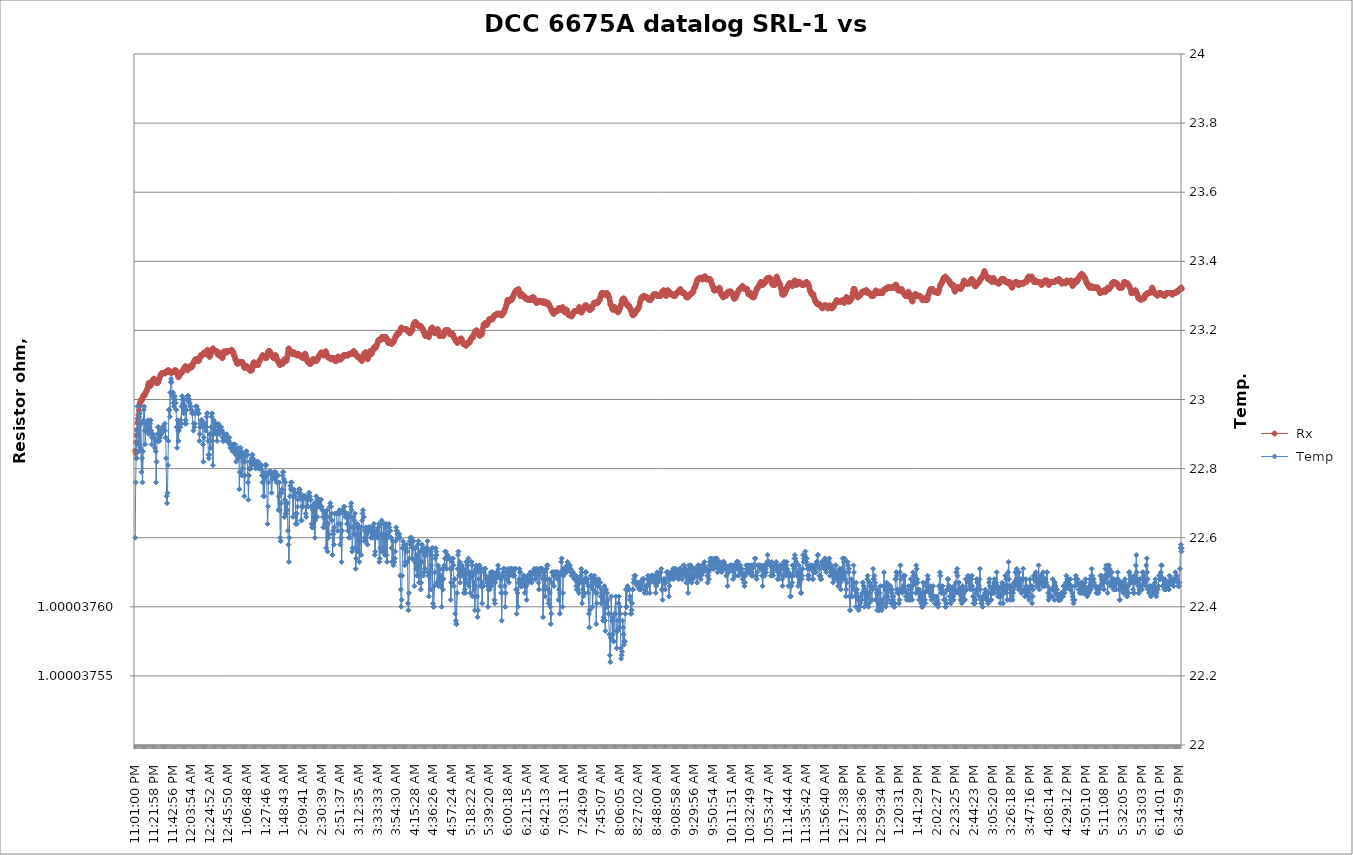
| Category |  Rx |
|---|---|
| 2021-03-23 23:01:00 | 1 |
| 2021-03-23 23:01:31 | 1 |
| 2021-03-23 23:02:02 | 1 |
| 2021-03-23 23:02:32 | 1 |
| 2021-03-23 23:03:03 | 1 |
| 2021-03-23 23:03:34 | 1 |
| 2021-03-23 23:04:04 | 1 |
| 2021-03-23 23:04:35 | 1 |
| 2021-03-23 23:05:06 | 1 |
| 2021-03-23 23:05:36 | 1 |
| 2021-03-23 23:06:07 | 1 |
| 2021-03-23 23:06:38 | 1 |
| 2021-03-23 23:07:08 | 1 |
| 2021-03-23 23:07:39 | 1 |
| 2021-03-23 23:08:10 | 1 |
| 2021-03-23 23:08:41 | 1 |
| 2021-03-23 23:09:11 | 1 |
| 2021-03-23 23:09:42 | 1 |
| 2021-03-23 23:10:13 | 1 |
| 2021-03-23 23:10:43 | 1 |
| 2021-03-23 23:11:14 | 1 |
| 2021-03-23 23:11:45 | 1 |
| 2021-03-23 23:12:15 | 1 |
| 2021-03-23 23:12:46 | 1 |
| 2021-03-23 23:13:17 | 1 |
| 2021-03-23 23:13:47 | 1 |
| 2021-03-23 23:14:18 | 1 |
| 2021-03-23 23:14:49 | 1 |
| 2021-03-23 23:15:19 | 1 |
| 2021-03-23 23:15:50 | 1 |
| 2021-03-23 23:16:21 | 1 |
| 2021-03-23 23:16:51 | 1 |
| 2021-03-23 23:17:22 | 1 |
| 2021-03-23 23:17:53 | 1 |
| 2021-03-23 23:18:23 | 1 |
| 2021-03-23 23:18:54 | 1 |
| 2021-03-23 23:19:25 | 1 |
| 2021-03-23 23:19:55 | 1 |
| 2021-03-23 23:20:26 | 1 |
| 2021-03-23 23:20:57 | 1 |
| 2021-03-23 23:21:28 | 1 |
| 2021-03-23 23:21:58 | 1 |
| 2021-03-23 23:22:29 | 1 |
| 2021-03-23 23:23:00 | 1 |
| 2021-03-23 23:23:30 | 1 |
| 2021-03-23 23:24:01 | 1 |
| 2021-03-23 23:24:32 | 1 |
| 2021-03-23 23:25:02 | 1 |
| 2021-03-23 23:25:33 | 1 |
| 2021-03-23 23:26:04 | 1 |
| 2021-03-23 23:26:34 | 1 |
| 2021-03-23 23:27:05 | 1 |
| 2021-03-23 23:27:36 | 1 |
| 2021-03-23 23:28:06 | 1 |
| 2021-03-23 23:28:37 | 1 |
| 2021-03-23 23:29:08 | 1 |
| 2021-03-23 23:29:38 | 1 |
| 2021-03-23 23:30:09 | 1 |
| 2021-03-23 23:30:40 | 1 |
| 2021-03-23 23:31:10 | 1 |
| 2021-03-23 23:31:41 | 1 |
| 2021-03-23 23:32:12 | 1 |
| 2021-03-23 23:32:42 | 1 |
| 2021-03-23 23:33:13 | 1 |
| 2021-03-23 23:33:44 | 1 |
| 2021-03-23 23:34:15 | 1 |
| 2021-03-23 23:34:45 | 1 |
| 2021-03-23 23:35:16 | 1 |
| 2021-03-23 23:35:47 | 1 |
| 2021-03-23 23:36:17 | 1 |
| 2021-03-23 23:36:48 | 1 |
| 2021-03-23 23:37:19 | 1 |
| 2021-03-23 23:37:49 | 1 |
| 2021-03-23 23:38:20 | 1 |
| 2021-03-23 23:38:51 | 1 |
| 2021-03-23 23:39:21 | 1 |
| 2021-03-23 23:39:52 | 1 |
| 2021-03-23 23:40:23 | 1 |
| 2021-03-23 23:40:53 | 1 |
| 2021-03-23 23:41:24 | 1 |
| 2021-03-23 23:41:55 | 1 |
| 2021-03-23 23:42:25 | 1 |
| 2021-03-23 23:42:56 | 1 |
| 2021-03-23 23:43:27 | 1 |
| 2021-03-23 23:43:57 | 1 |
| 2021-03-23 23:44:28 | 1 |
| 2021-03-23 23:44:59 | 1 |
| 2021-03-23 23:45:30 | 1 |
| 2021-03-23 23:46:00 | 1 |
| 2021-03-23 23:46:31 | 1 |
| 2021-03-23 23:47:02 | 1 |
| 2021-03-23 23:47:32 | 1 |
| 2021-03-23 23:48:03 | 1 |
| 2021-03-23 23:48:34 | 1 |
| 2021-03-23 23:49:04 | 1 |
| 2021-03-23 23:49:35 | 1 |
| 2021-03-23 23:50:06 | 1 |
| 2021-03-23 23:50:36 | 1 |
| 2021-03-23 23:51:07 | 1 |
| 2021-03-23 23:51:38 | 1 |
| 2021-03-23 23:52:08 | 1 |
| 2021-03-23 23:52:39 | 1 |
| 2021-03-23 23:53:10 | 1 |
| 2021-03-23 23:53:40 | 1 |
| 2021-03-23 23:54:11 | 1 |
| 2021-03-23 23:54:42 | 1 |
| 2021-03-23 23:55:12 | 1 |
| 2021-03-23 23:55:43 | 1 |
| 2021-03-23 23:56:14 | 1 |
| 2021-03-23 23:56:45 | 1 |
| 2021-03-23 23:57:15 | 1 |
| 2021-03-23 23:57:46 | 1 |
| 2021-03-23 23:58:17 | 1 |
| 2021-03-23 23:58:47 | 1 |
| 2021-03-23 23:59:18 | 1 |
| 2021-03-23 23:59:49 | 1 |
| 2021-03-24 00:00:19 | 1 |
| 2021-03-24 00:00:50 | 1 |
| 2021-03-24 00:01:21 | 1 |
| 2021-03-24 00:01:51 | 1 |
| 2021-03-24 00:02:22 | 1 |
| 2021-03-24 00:02:53 | 1 |
| 2021-03-24 00:03:23 | 1 |
| 2021-03-24 00:03:54 | 1 |
| 2021-03-24 00:04:25 | 1 |
| 2021-03-24 00:04:55 | 1 |
| 2021-03-24 00:05:26 | 1 |
| 2021-03-24 00:05:57 | 1 |
| 2021-03-24 00:06:28 | 1 |
| 2021-03-24 00:06:58 | 1 |
| 2021-03-24 00:07:29 | 1 |
| 2021-03-24 00:08:00 | 1 |
| 2021-03-24 00:08:30 | 1 |
| 2021-03-24 00:09:01 | 1 |
| 2021-03-24 00:09:32 | 1 |
| 2021-03-24 00:10:02 | 1 |
| 2021-03-24 00:10:33 | 1 |
| 2021-03-24 00:11:04 | 1 |
| 2021-03-24 00:11:34 | 1 |
| 2021-03-24 00:12:05 | 1 |
| 2021-03-24 00:12:36 | 1 |
| 2021-03-24 00:13:06 | 1 |
| 2021-03-24 00:13:37 | 1 |
| 2021-03-24 00:14:08 | 1 |
| 2021-03-24 00:14:38 | 1 |
| 2021-03-24 00:15:09 | 1 |
| 2021-03-24 00:15:40 | 1 |
| 2021-03-24 00:16:10 | 1 |
| 2021-03-24 00:16:41 | 1 |
| 2021-03-24 00:17:12 | 1 |
| 2021-03-24 00:17:42 | 1 |
| 2021-03-24 00:18:13 | 1 |
| 2021-03-24 00:18:44 | 1 |
| 2021-03-24 00:19:14 | 1 |
| 2021-03-24 00:19:45 | 1 |
| 2021-03-24 00:20:16 | 1 |
| 2021-03-24 00:20:47 | 1 |
| 2021-03-24 00:21:17 | 1 |
| 2021-03-24 00:21:48 | 1 |
| 2021-03-24 00:22:19 | 1 |
| 2021-03-24 00:22:49 | 1 |
| 2021-03-24 00:23:20 | 1 |
| 2021-03-24 00:23:51 | 1 |
| 2021-03-24 00:24:21 | 1 |
| 2021-03-24 00:24:52 | 1 |
| 2021-03-24 00:25:23 | 1 |
| 2021-03-24 00:25:53 | 1 |
| 2021-03-24 00:26:24 | 1 |
| 2021-03-24 00:26:55 | 1 |
| 2021-03-24 00:27:25 | 1 |
| 2021-03-24 00:27:56 | 1 |
| 2021-03-24 00:28:27 | 1 |
| 2021-03-24 00:28:57 | 1 |
| 2021-03-24 00:29:28 | 1 |
| 2021-03-24 00:29:59 | 1 |
| 2021-03-24 00:30:29 | 1 |
| 2021-03-24 00:31:00 | 1 |
| 2021-03-24 00:31:31 | 1 |
| 2021-03-24 00:32:02 | 1 |
| 2021-03-24 00:32:32 | 1 |
| 2021-03-24 00:33:03 | 1 |
| 2021-03-24 00:33:34 | 1 |
| 2021-03-24 00:34:04 | 1 |
| 2021-03-24 00:34:35 | 1 |
| 2021-03-24 00:35:06 | 1 |
| 2021-03-24 00:35:36 | 1 |
| 2021-03-24 00:36:07 | 1 |
| 2021-03-24 00:36:38 | 1 |
| 2021-03-24 00:37:08 | 1 |
| 2021-03-24 00:37:39 | 1 |
| 2021-03-24 00:38:10 | 1 |
| 2021-03-24 00:38:40 | 1 |
| 2021-03-24 00:39:11 | 1 |
| 2021-03-24 00:39:42 | 1 |
| 2021-03-24 00:40:12 | 1 |
| 2021-03-24 00:40:43 | 1 |
| 2021-03-24 00:41:14 | 1 |
| 2021-03-24 00:41:44 | 1 |
| 2021-03-24 00:42:15 | 1 |
| 2021-03-24 00:42:46 | 1 |
| 2021-03-24 00:43:17 | 1 |
| 2021-03-24 00:43:47 | 1 |
| 2021-03-24 00:44:18 | 1 |
| 2021-03-24 00:44:49 | 1 |
| 2021-03-24 00:45:19 | 1 |
| 2021-03-24 00:45:50 | 1 |
| 2021-03-24 00:46:21 | 1 |
| 2021-03-24 00:46:51 | 1 |
| 2021-03-24 00:47:22 | 1 |
| 2021-03-24 00:47:53 | 1 |
| 2021-03-24 00:48:23 | 1 |
| 2021-03-24 00:48:54 | 1 |
| 2021-03-24 00:49:25 | 1 |
| 2021-03-24 00:49:55 | 1 |
| 2021-03-24 00:50:26 | 1 |
| 2021-03-24 00:50:57 | 1 |
| 2021-03-24 00:51:27 | 1 |
| 2021-03-24 00:51:58 | 1 |
| 2021-03-24 00:52:29 | 1 |
| 2021-03-24 00:52:59 | 1 |
| 2021-03-24 00:53:30 | 1 |
| 2021-03-24 00:54:01 | 1 |
| 2021-03-24 00:54:31 | 1 |
| 2021-03-24 00:55:02 | 1 |
| 2021-03-24 00:55:33 | 1 |
| 2021-03-24 00:56:03 | 1 |
| 2021-03-24 00:56:34 | 1 |
| 2021-03-24 00:57:05 | 1 |
| 2021-03-24 00:57:36 | 1 |
| 2021-03-24 00:58:06 | 1 |
| 2021-03-24 00:58:37 | 1 |
| 2021-03-24 00:59:08 | 1 |
| 2021-03-24 00:59:38 | 1 |
| 2021-03-24 01:00:09 | 1 |
| 2021-03-24 01:00:40 | 1 |
| 2021-03-24 01:01:10 | 1 |
| 2021-03-24 01:01:41 | 1 |
| 2021-03-24 01:02:12 | 1 |
| 2021-03-24 01:02:42 | 1 |
| 2021-03-24 01:03:13 | 1 |
| 2021-03-24 01:03:44 | 1 |
| 2021-03-24 01:04:14 | 1 |
| 2021-03-24 01:04:45 | 1 |
| 2021-03-24 01:05:16 | 1 |
| 2021-03-24 01:05:46 | 1 |
| 2021-03-24 01:06:17 | 1 |
| 2021-03-24 01:06:48 | 1 |
| 2021-03-24 01:07:18 | 1 |
| 2021-03-24 01:07:49 | 1 |
| 2021-03-24 01:08:20 | 1 |
| 2021-03-24 01:08:50 | 1 |
| 2021-03-24 01:09:21 | 1 |
| 2021-03-24 01:09:52 | 1 |
| 2021-03-24 01:10:22 | 1 |
| 2021-03-24 01:10:53 | 1 |
| 2021-03-24 01:11:24 | 1 |
| 2021-03-24 01:11:55 | 1 |
| 2021-03-24 01:12:25 | 1 |
| 2021-03-24 01:12:56 | 1 |
| 2021-03-24 01:13:27 | 1 |
| 2021-03-24 01:13:57 | 1 |
| 2021-03-24 01:14:28 | 1 |
| 2021-03-24 01:14:59 | 1 |
| 2021-03-24 01:15:29 | 1 |
| 2021-03-24 01:16:00 | 1 |
| 2021-03-24 01:16:31 | 1 |
| 2021-03-24 01:17:01 | 1 |
| 2021-03-24 01:17:32 | 1 |
| 2021-03-24 01:18:03 | 1 |
| 2021-03-24 01:18:33 | 1 |
| 2021-03-24 01:19:04 | 1 |
| 2021-03-24 01:19:35 | 1 |
| 2021-03-24 01:20:05 | 1 |
| 2021-03-24 01:20:36 | 1 |
| 2021-03-24 01:21:07 | 1 |
| 2021-03-24 01:21:37 | 1 |
| 2021-03-24 01:22:08 | 1 |
| 2021-03-24 01:22:39 | 1 |
| 2021-03-24 01:23:09 | 1 |
| 2021-03-24 01:23:40 | 1 |
| 2021-03-24 01:24:11 | 1 |
| 2021-03-24 01:24:42 | 1 |
| 2021-03-24 01:25:12 | 1 |
| 2021-03-24 01:25:43 | 1 |
| 2021-03-24 01:26:14 | 1 |
| 2021-03-24 01:26:44 | 1 |
| 2021-03-24 01:27:15 | 1 |
| 2021-03-24 01:27:46 | 1 |
| 2021-03-24 01:28:16 | 1 |
| 2021-03-24 01:28:47 | 1 |
| 2021-03-24 01:29:18 | 1 |
| 2021-03-24 01:29:48 | 1 |
| 2021-03-24 01:30:19 | 1 |
| 2021-03-24 01:30:50 | 1 |
| 2021-03-24 01:31:20 | 1 |
| 2021-03-24 01:31:51 | 1 |
| 2021-03-24 01:32:22 | 1 |
| 2021-03-24 01:32:52 | 1 |
| 2021-03-24 01:33:23 | 1 |
| 2021-03-24 01:33:54 | 1 |
| 2021-03-24 01:34:24 | 1 |
| 2021-03-24 01:34:55 | 1 |
| 2021-03-24 01:35:26 | 1 |
| 2021-03-24 01:35:56 | 1 |
| 2021-03-24 01:36:27 | 1 |
| 2021-03-24 01:36:58 | 1 |
| 2021-03-24 01:37:29 | 1 |
| 2021-03-24 01:37:59 | 1 |
| 2021-03-24 01:38:30 | 1 |
| 2021-03-24 01:39:01 | 1 |
| 2021-03-24 01:39:31 | 1 |
| 2021-03-24 01:40:02 | 1 |
| 2021-03-24 01:40:33 | 1 |
| 2021-03-24 01:41:03 | 1 |
| 2021-03-24 01:41:34 | 1 |
| 2021-03-24 01:42:05 | 1 |
| 2021-03-24 01:42:35 | 1 |
| 2021-03-24 01:43:06 | 1 |
| 2021-03-24 01:43:37 | 1 |
| 2021-03-24 01:44:07 | 1 |
| 2021-03-24 01:44:38 | 1 |
| 2021-03-24 01:45:09 | 1 |
| 2021-03-24 01:45:39 | 1 |
| 2021-03-24 01:46:10 | 1 |
| 2021-03-24 01:46:41 | 1 |
| 2021-03-24 01:47:11 | 1 |
| 2021-03-24 01:47:42 | 1 |
| 2021-03-24 01:48:13 | 1 |
| 2021-03-24 01:48:43 | 1 |
| 2021-03-24 01:49:14 | 1 |
| 2021-03-24 01:49:45 | 1 |
| 2021-03-24 01:50:15 | 1 |
| 2021-03-24 01:50:46 | 1 |
| 2021-03-24 01:51:17 | 1 |
| 2021-03-24 01:51:48 | 1 |
| 2021-03-24 01:52:18 | 1 |
| 2021-03-24 01:52:49 | 1 |
| 2021-03-24 01:53:20 | 1 |
| 2021-03-24 01:53:50 | 1 |
| 2021-03-24 01:54:21 | 1 |
| 2021-03-24 01:54:52 | 1 |
| 2021-03-24 01:55:22 | 1 |
| 2021-03-24 01:55:53 | 1 |
| 2021-03-24 01:56:24 | 1 |
| 2021-03-24 01:56:54 | 1 |
| 2021-03-24 01:57:25 | 1 |
| 2021-03-24 01:57:56 | 1 |
| 2021-03-24 01:58:26 | 1 |
| 2021-03-24 01:58:57 | 1 |
| 2021-03-24 01:59:28 | 1 |
| 2021-03-24 01:59:58 | 1 |
| 2021-03-24 02:00:29 | 1 |
| 2021-03-24 02:01:00 | 1 |
| 2021-03-24 02:01:30 | 1 |
| 2021-03-24 02:02:01 | 1 |
| 2021-03-24 02:02:32 | 1 |
| 2021-03-24 02:03:02 | 1 |
| 2021-03-24 02:03:33 | 1 |
| 2021-03-24 02:04:04 | 1 |
| 2021-03-24 02:04:35 | 1 |
| 2021-03-24 02:05:05 | 1 |
| 2021-03-24 02:05:36 | 1 |
| 2021-03-24 02:06:07 | 1 |
| 2021-03-24 02:06:37 | 1 |
| 2021-03-24 02:07:08 | 1 |
| 2021-03-24 02:07:39 | 1 |
| 2021-03-24 02:08:09 | 1 |
| 2021-03-24 02:08:40 | 1 |
| 2021-03-24 02:09:11 | 1 |
| 2021-03-24 02:09:41 | 1 |
| 2021-03-24 02:10:12 | 1 |
| 2021-03-24 02:10:43 | 1 |
| 2021-03-24 02:11:13 | 1 |
| 2021-03-24 02:11:44 | 1 |
| 2021-03-24 02:12:15 | 1 |
| 2021-03-24 02:12:45 | 1 |
| 2021-03-24 02:13:16 | 1 |
| 2021-03-24 02:13:47 | 1 |
| 2021-03-24 02:14:17 | 1 |
| 2021-03-24 02:14:48 | 1 |
| 2021-03-24 02:15:19 | 1 |
| 2021-03-24 02:15:49 | 1 |
| 2021-03-24 02:16:20 | 1 |
| 2021-03-24 02:16:51 | 1 |
| 2021-03-24 02:17:21 | 1 |
| 2021-03-24 02:17:52 | 1 |
| 2021-03-24 02:18:23 | 1 |
| 2021-03-24 02:18:54 | 1 |
| 2021-03-24 02:19:24 | 1 |
| 2021-03-24 02:19:55 | 1 |
| 2021-03-24 02:20:26 | 1 |
| 2021-03-24 02:20:56 | 1 |
| 2021-03-24 02:21:27 | 1 |
| 2021-03-24 02:21:58 | 1 |
| 2021-03-24 02:22:28 | 1 |
| 2021-03-24 02:22:59 | 1 |
| 2021-03-24 02:23:30 | 1 |
| 2021-03-24 02:24:00 | 1 |
| 2021-03-24 02:24:31 | 1 |
| 2021-03-24 02:25:02 | 1 |
| 2021-03-24 02:25:32 | 1 |
| 2021-03-24 02:26:03 | 1 |
| 2021-03-24 02:26:34 | 1 |
| 2021-03-24 02:27:04 | 1 |
| 2021-03-24 02:27:35 | 1 |
| 2021-03-24 02:28:06 | 1 |
| 2021-03-24 02:28:36 | 1 |
| 2021-03-24 02:29:07 | 1 |
| 2021-03-24 02:29:38 | 1 |
| 2021-03-24 02:30:08 | 1 |
| 2021-03-24 02:30:39 | 1 |
| 2021-03-24 02:31:10 | 1 |
| 2021-03-24 02:31:41 | 1 |
| 2021-03-24 02:32:11 | 1 |
| 2021-03-24 02:32:42 | 1 |
| 2021-03-24 02:33:13 | 1 |
| 2021-03-24 02:33:43 | 1 |
| 2021-03-24 02:34:14 | 1 |
| 2021-03-24 02:34:45 | 1 |
| 2021-03-24 02:35:15 | 1 |
| 2021-03-24 02:35:46 | 1 |
| 2021-03-24 02:36:17 | 1 |
| 2021-03-24 02:36:47 | 1 |
| 2021-03-24 02:37:18 | 1 |
| 2021-03-24 02:37:49 | 1 |
| 2021-03-24 02:38:19 | 1 |
| 2021-03-24 02:38:50 | 1 |
| 2021-03-24 02:39:21 | 1 |
| 2021-03-24 02:39:51 | 1 |
| 2021-03-24 02:40:22 | 1 |
| 2021-03-24 02:40:53 | 1 |
| 2021-03-24 02:41:23 | 1 |
| 2021-03-24 02:41:54 | 1 |
| 2021-03-24 02:42:25 | 1 |
| 2021-03-24 02:42:55 | 1 |
| 2021-03-24 02:43:26 | 1 |
| 2021-03-24 02:43:57 | 1 |
| 2021-03-24 02:44:27 | 1 |
| 2021-03-24 02:44:58 | 1 |
| 2021-03-24 02:45:29 | 1 |
| 2021-03-24 02:46:00 | 1 |
| 2021-03-24 02:46:30 | 1 |
| 2021-03-24 02:47:01 | 1 |
| 2021-03-24 02:47:32 | 1 |
| 2021-03-24 02:48:02 | 1 |
| 2021-03-24 02:48:33 | 1 |
| 2021-03-24 02:49:04 | 1 |
| 2021-03-24 02:49:34 | 1 |
| 2021-03-24 02:50:05 | 1 |
| 2021-03-24 02:50:36 | 1 |
| 2021-03-24 02:51:06 | 1 |
| 2021-03-24 02:51:37 | 1 |
| 2021-03-24 02:52:08 | 1 |
| 2021-03-24 02:52:38 | 1 |
| 2021-03-24 02:53:09 | 1 |
| 2021-03-24 02:53:40 | 1 |
| 2021-03-24 02:54:10 | 1 |
| 2021-03-24 02:54:41 | 1 |
| 2021-03-24 02:55:12 | 1 |
| 2021-03-24 02:55:42 | 1 |
| 2021-03-24 02:56:13 | 1 |
| 2021-03-24 02:56:44 | 1 |
| 2021-03-24 02:57:14 | 1 |
| 2021-03-24 02:57:45 | 1 |
| 2021-03-24 02:58:16 | 1 |
| 2021-03-24 02:58:46 | 1 |
| 2021-03-24 02:59:17 | 1 |
| 2021-03-24 02:59:48 | 1 |
| 2021-03-24 03:00:19 | 1 |
| 2021-03-24 03:00:49 | 1 |
| 2021-03-24 03:01:20 | 1 |
| 2021-03-24 03:01:51 | 1 |
| 2021-03-24 03:02:21 | 1 |
| 2021-03-24 03:02:52 | 1 |
| 2021-03-24 03:03:23 | 1 |
| 2021-03-24 03:03:53 | 1 |
| 2021-03-24 03:04:24 | 1 |
| 2021-03-24 03:04:55 | 1 |
| 2021-03-24 03:05:25 | 1 |
| 2021-03-24 03:05:56 | 1 |
| 2021-03-24 03:06:27 | 1 |
| 2021-03-24 03:06:57 | 1 |
| 2021-03-24 03:07:28 | 1 |
| 2021-03-24 03:07:59 | 1 |
| 2021-03-24 03:08:29 | 1 |
| 2021-03-24 03:09:00 | 1 |
| 2021-03-24 03:09:31 | 1 |
| 2021-03-24 03:10:01 | 1 |
| 2021-03-24 03:10:32 | 1 |
| 2021-03-24 03:11:03 | 1 |
| 2021-03-24 03:11:33 | 1 |
| 2021-03-24 03:12:04 | 1 |
| 2021-03-24 03:12:35 | 1 |
| 2021-03-24 03:13:05 | 1 |
| 2021-03-24 03:13:36 | 1 |
| 2021-03-24 03:14:07 | 1 |
| 2021-03-24 03:14:38 | 1 |
| 2021-03-24 03:15:08 | 1 |
| 2021-03-24 03:15:39 | 1 |
| 2021-03-24 03:16:10 | 1 |
| 2021-03-24 03:16:40 | 1 |
| 2021-03-24 03:17:11 | 1 |
| 2021-03-24 03:17:42 | 1 |
| 2021-03-24 03:18:12 | 1 |
| 2021-03-24 03:18:43 | 1 |
| 2021-03-24 03:19:14 | 1 |
| 2021-03-24 03:19:44 | 1 |
| 2021-03-24 03:20:15 | 1 |
| 2021-03-24 03:20:46 | 1 |
| 2021-03-24 03:21:16 | 1 |
| 2021-03-24 03:21:47 | 1 |
| 2021-03-24 03:22:18 | 1 |
| 2021-03-24 03:22:48 | 1 |
| 2021-03-24 03:23:19 | 1 |
| 2021-03-24 03:23:50 | 1 |
| 2021-03-24 03:24:20 | 1 |
| 2021-03-24 03:24:51 | 1 |
| 2021-03-24 03:25:22 | 1 |
| 2021-03-24 03:25:52 | 1 |
| 2021-03-24 03:26:23 | 1 |
| 2021-03-24 03:26:54 | 1 |
| 2021-03-24 03:27:24 | 1 |
| 2021-03-24 03:27:55 | 1 |
| 2021-03-24 03:28:26 | 1 |
| 2021-03-24 03:28:57 | 1 |
| 2021-03-24 03:29:27 | 1 |
| 2021-03-24 03:29:58 | 1 |
| 2021-03-24 03:30:29 | 1 |
| 2021-03-24 03:30:59 | 1 |
| 2021-03-24 03:31:30 | 1 |
| 2021-03-24 03:32:01 | 1 |
| 2021-03-24 03:32:31 | 1 |
| 2021-03-24 03:33:02 | 1 |
| 2021-03-24 03:33:33 | 1 |
| 2021-03-24 03:34:03 | 1 |
| 2021-03-24 03:34:34 | 1 |
| 2021-03-24 03:35:05 | 1 |
| 2021-03-24 03:35:35 | 1 |
| 2021-03-24 03:36:06 | 1 |
| 2021-03-24 03:36:37 | 1 |
| 2021-03-24 03:37:07 | 1 |
| 2021-03-24 03:37:38 | 1 |
| 2021-03-24 03:38:09 | 1 |
| 2021-03-24 03:38:39 | 1 |
| 2021-03-24 03:39:10 | 1 |
| 2021-03-24 03:39:41 | 1 |
| 2021-03-24 03:40:11 | 1 |
| 2021-03-24 03:40:42 | 1 |
| 2021-03-24 03:41:13 | 1 |
| 2021-03-24 03:41:43 | 1 |
| 2021-03-24 03:42:14 | 1 |
| 2021-03-24 03:42:45 | 1 |
| 2021-03-24 03:43:16 | 1 |
| 2021-03-24 03:43:46 | 1 |
| 2021-03-24 03:44:17 | 1 |
| 2021-03-24 03:44:48 | 1 |
| 2021-03-24 03:45:18 | 1 |
| 2021-03-24 03:45:49 | 1 |
| 2021-03-24 03:46:20 | 1 |
| 2021-03-24 03:46:50 | 1 |
| 2021-03-24 03:47:21 | 1 |
| 2021-03-24 03:47:52 | 1 |
| 2021-03-24 03:48:22 | 1 |
| 2021-03-24 03:48:53 | 1 |
| 2021-03-24 03:49:24 | 1 |
| 2021-03-24 03:49:54 | 1 |
| 2021-03-24 03:50:25 | 1 |
| 2021-03-24 03:50:56 | 1 |
| 2021-03-24 03:51:26 | 1 |
| 2021-03-24 03:51:57 | 1 |
| 2021-03-24 03:52:28 | 1 |
| 2021-03-24 03:52:58 | 1 |
| 2021-03-24 03:53:29 | 1 |
| 2021-03-24 03:54:00 | 1 |
| 2021-03-24 03:54:30 | 1 |
| 2021-03-24 03:55:01 | 1 |
| 2021-03-24 03:55:32 | 1 |
| 2021-03-24 03:56:03 | 1 |
| 2021-03-24 03:56:33 | 1 |
| 2021-03-24 03:57:04 | 1 |
| 2021-03-24 03:57:35 | 1 |
| 2021-03-24 03:58:05 | 1 |
| 2021-03-24 03:58:36 | 1 |
| 2021-03-24 03:59:07 | 1 |
| 2021-03-24 03:59:37 | 1 |
| 2021-03-24 04:00:08 | 1 |
| 2021-03-24 04:00:39 | 1 |
| 2021-03-24 04:01:09 | 1 |
| 2021-03-24 04:01:40 | 1 |
| 2021-03-24 04:02:11 | 1 |
| 2021-03-24 04:02:41 | 1 |
| 2021-03-24 04:03:12 | 1 |
| 2021-03-24 04:03:43 | 1 |
| 2021-03-24 04:04:13 | 1 |
| 2021-03-24 04:04:44 | 1 |
| 2021-03-24 04:05:15 | 1 |
| 2021-03-24 04:05:45 | 1 |
| 2021-03-24 04:06:16 | 1 |
| 2021-03-24 04:06:47 | 1 |
| 2021-03-24 04:07:17 | 1 |
| 2021-03-24 04:07:48 | 1 |
| 2021-03-24 04:08:19 | 1 |
| 2021-03-24 04:08:49 | 1 |
| 2021-03-24 04:09:20 | 1 |
| 2021-03-24 04:09:51 | 1 |
| 2021-03-24 04:10:22 | 1 |
| 2021-03-24 04:10:52 | 1 |
| 2021-03-24 04:11:23 | 1 |
| 2021-03-24 04:11:54 | 1 |
| 2021-03-24 04:12:24 | 1 |
| 2021-03-24 04:12:55 | 1 |
| 2021-03-24 04:13:26 | 1 |
| 2021-03-24 04:13:56 | 1 |
| 2021-03-24 04:14:27 | 1 |
| 2021-03-24 04:14:58 | 1 |
| 2021-03-24 04:15:28 | 1 |
| 2021-03-24 04:15:59 | 1 |
| 2021-03-24 04:16:30 | 1 |
| 2021-03-24 04:17:00 | 1 |
| 2021-03-24 04:17:31 | 1 |
| 2021-03-24 04:18:02 | 1 |
| 2021-03-24 04:18:32 | 1 |
| 2021-03-24 04:19:03 | 1 |
| 2021-03-24 04:19:34 | 1 |
| 2021-03-24 04:20:04 | 1 |
| 2021-03-24 04:20:35 | 1 |
| 2021-03-24 04:21:06 | 1 |
| 2021-03-24 04:21:36 | 1 |
| 2021-03-24 04:22:07 | 1 |
| 2021-03-24 04:22:38 | 1 |
| 2021-03-24 04:23:08 | 1 |
| 2021-03-24 04:23:39 | 1 |
| 2021-03-24 04:24:10 | 1 |
| 2021-03-24 04:24:40 | 1 |
| 2021-03-24 04:25:11 | 1 |
| 2021-03-24 04:25:42 | 1 |
| 2021-03-24 04:26:13 | 1 |
| 2021-03-24 04:26:43 | 1 |
| 2021-03-24 04:27:14 | 1 |
| 2021-03-24 04:27:45 | 1 |
| 2021-03-24 04:28:15 | 1 |
| 2021-03-24 04:28:46 | 1 |
| 2021-03-24 04:29:17 | 1 |
| 2021-03-24 04:29:47 | 1 |
| 2021-03-24 04:30:18 | 1 |
| 2021-03-24 04:30:49 | 1 |
| 2021-03-24 04:31:19 | 1 |
| 2021-03-24 04:31:50 | 1 |
| 2021-03-24 04:32:21 | 1 |
| 2021-03-24 04:32:51 | 1 |
| 2021-03-24 04:33:22 | 1 |
| 2021-03-24 04:33:53 | 1 |
| 2021-03-24 04:34:23 | 1 |
| 2021-03-24 04:34:54 | 1 |
| 2021-03-24 04:35:25 | 1 |
| 2021-03-24 04:35:55 | 1 |
| 2021-03-24 04:36:26 | 1 |
| 2021-03-24 04:36:57 | 1 |
| 2021-03-24 04:37:27 | 1 |
| 2021-03-24 04:37:58 | 1 |
| 2021-03-24 04:38:29 | 1 |
| 2021-03-24 04:38:59 | 1 |
| 2021-03-24 04:39:30 | 1 |
| 2021-03-24 04:40:01 | 1 |
| 2021-03-24 04:40:32 | 1 |
| 2021-03-24 04:41:02 | 1 |
| 2021-03-24 04:41:33 | 1 |
| 2021-03-24 04:42:04 | 1 |
| 2021-03-24 04:42:34 | 1 |
| 2021-03-24 04:43:05 | 1 |
| 2021-03-24 04:43:36 | 1 |
| 2021-03-24 04:44:06 | 1 |
| 2021-03-24 04:44:37 | 1 |
| 2021-03-24 04:45:08 | 1 |
| 2021-03-24 04:45:38 | 1 |
| 2021-03-24 04:46:09 | 1 |
| 2021-03-24 04:46:40 | 1 |
| 2021-03-24 04:47:10 | 1 |
| 2021-03-24 04:47:41 | 1 |
| 2021-03-24 04:48:12 | 1 |
| 2021-03-24 04:48:42 | 1 |
| 2021-03-24 04:49:13 | 1 |
| 2021-03-24 04:49:44 | 1 |
| 2021-03-24 04:50:14 | 1 |
| 2021-03-24 04:50:45 | 1 |
| 2021-03-24 04:51:16 | 1 |
| 2021-03-24 04:51:46 | 1 |
| 2021-03-24 04:52:17 | 1 |
| 2021-03-24 04:52:48 | 1 |
| 2021-03-24 04:53:19 | 1 |
| 2021-03-24 04:53:49 | 1 |
| 2021-03-24 04:54:20 | 1 |
| 2021-03-24 04:54:51 | 1 |
| 2021-03-24 04:55:21 | 1 |
| 2021-03-24 04:55:52 | 1 |
| 2021-03-24 04:56:23 | 1 |
| 2021-03-24 04:56:53 | 1 |
| 2021-03-24 04:57:24 | 1 |
| 2021-03-24 04:57:55 | 1 |
| 2021-03-24 04:58:25 | 1 |
| 2021-03-24 04:58:56 | 1 |
| 2021-03-24 04:59:27 | 1 |
| 2021-03-24 04:59:57 | 1 |
| 2021-03-24 05:00:28 | 1 |
| 2021-03-24 05:00:59 | 1 |
| 2021-03-24 05:01:29 | 1 |
| 2021-03-24 05:02:00 | 1 |
| 2021-03-24 05:02:31 | 1 |
| 2021-03-24 05:03:01 | 1 |
| 2021-03-24 05:03:32 | 1 |
| 2021-03-24 05:04:03 | 1 |
| 2021-03-24 05:04:33 | 1 |
| 2021-03-24 05:05:04 | 1 |
| 2021-03-24 05:05:35 | 1 |
| 2021-03-24 05:06:06 | 1 |
| 2021-03-24 05:06:36 | 1 |
| 2021-03-24 05:07:07 | 1 |
| 2021-03-24 05:07:38 | 1 |
| 2021-03-24 05:08:08 | 1 |
| 2021-03-24 05:08:39 | 1 |
| 2021-03-24 05:09:10 | 1 |
| 2021-03-24 05:09:40 | 1 |
| 2021-03-24 05:10:11 | 1 |
| 2021-03-24 05:10:42 | 1 |
| 2021-03-24 05:11:12 | 1 |
| 2021-03-24 05:11:43 | 1 |
| 2021-03-24 05:12:14 | 1 |
| 2021-03-24 05:12:44 | 1 |
| 2021-03-24 05:13:15 | 1 |
| 2021-03-24 05:13:46 | 1 |
| 2021-03-24 05:14:16 | 1 |
| 2021-03-24 05:14:47 | 1 |
| 2021-03-24 05:15:18 | 1 |
| 2021-03-24 05:15:48 | 1 |
| 2021-03-24 05:16:19 | 1 |
| 2021-03-24 05:16:50 | 1 |
| 2021-03-24 05:17:20 | 1 |
| 2021-03-24 05:17:51 | 1 |
| 2021-03-24 05:18:22 | 1 |
| 2021-03-24 05:18:53 | 1 |
| 2021-03-24 05:19:23 | 1 |
| 2021-03-24 05:19:54 | 1 |
| 2021-03-24 05:20:25 | 1 |
| 2021-03-24 05:20:55 | 1 |
| 2021-03-24 05:21:26 | 1 |
| 2021-03-24 05:21:57 | 1 |
| 2021-03-24 05:22:27 | 1 |
| 2021-03-24 05:22:58 | 1 |
| 2021-03-24 05:23:29 | 1 |
| 2021-03-24 05:23:59 | 1 |
| 2021-03-24 05:24:30 | 1 |
| 2021-03-24 05:25:01 | 1 |
| 2021-03-24 05:25:31 | 1 |
| 2021-03-24 05:26:02 | 1 |
| 2021-03-24 05:26:33 | 1 |
| 2021-03-24 05:27:03 | 1 |
| 2021-03-24 05:27:34 | 1 |
| 2021-03-24 05:28:05 | 1 |
| 2021-03-24 05:28:35 | 1 |
| 2021-03-24 05:29:06 | 1 |
| 2021-03-24 05:29:37 | 1 |
| 2021-03-24 05:30:08 | 1 |
| 2021-03-24 05:30:38 | 1 |
| 2021-03-24 05:31:09 | 1 |
| 2021-03-24 05:31:40 | 1 |
| 2021-03-24 05:32:10 | 1 |
| 2021-03-24 05:32:41 | 1 |
| 2021-03-24 05:33:12 | 1 |
| 2021-03-24 05:33:42 | 1 |
| 2021-03-24 05:34:13 | 1 |
| 2021-03-24 05:34:44 | 1 |
| 2021-03-24 05:35:14 | 1 |
| 2021-03-24 05:35:45 | 1 |
| 2021-03-24 05:36:16 | 1 |
| 2021-03-24 05:36:46 | 1 |
| 2021-03-24 05:37:17 | 1 |
| 2021-03-24 05:37:48 | 1 |
| 2021-03-24 05:38:18 | 1 |
| 2021-03-24 05:38:49 | 1 |
| 2021-03-24 05:39:20 | 1 |
| 2021-03-24 05:39:50 | 1 |
| 2021-03-24 05:40:21 | 1 |
| 2021-03-24 05:40:52 | 1 |
| 2021-03-24 05:41:22 | 1 |
| 2021-03-24 05:41:53 | 1 |
| 2021-03-24 05:42:24 | 1 |
| 2021-03-24 05:42:54 | 1 |
| 2021-03-24 05:43:25 | 1 |
| 2021-03-24 05:43:56 | 1 |
| 2021-03-24 05:44:27 | 1 |
| 2021-03-24 05:44:57 | 1 |
| 2021-03-24 05:45:28 | 1 |
| 2021-03-24 05:45:59 | 1 |
| 2021-03-24 05:46:29 | 1 |
| 2021-03-24 05:47:00 | 1 |
| 2021-03-24 05:47:31 | 1 |
| 2021-03-24 05:48:01 | 1 |
| 2021-03-24 05:48:32 | 1 |
| 2021-03-24 05:49:03 | 1 |
| 2021-03-24 05:49:33 | 1 |
| 2021-03-24 05:50:04 | 1 |
| 2021-03-24 05:50:35 | 1 |
| 2021-03-24 05:51:05 | 1 |
| 2021-03-24 05:51:36 | 1 |
| 2021-03-24 05:52:07 | 1 |
| 2021-03-24 05:52:37 | 1 |
| 2021-03-24 05:53:08 | 1 |
| 2021-03-24 05:53:39 | 1 |
| 2021-03-24 05:54:09 | 1 |
| 2021-03-24 05:54:40 | 1 |
| 2021-03-24 05:55:11 | 1 |
| 2021-03-24 05:55:41 | 1 |
| 2021-03-24 05:56:12 | 1 |
| 2021-03-24 05:56:43 | 1 |
| 2021-03-24 05:57:13 | 1 |
| 2021-03-24 05:57:44 | 1 |
| 2021-03-24 05:58:15 | 1 |
| 2021-03-24 05:58:46 | 1 |
| 2021-03-24 05:59:16 | 1 |
| 2021-03-24 05:59:47 | 1 |
| 2021-03-24 06:00:18 | 1 |
| 2021-03-24 06:00:48 | 1 |
| 2021-03-24 06:01:19 | 1 |
| 2021-03-24 06:01:50 | 1 |
| 2021-03-24 06:02:20 | 1 |
| 2021-03-24 06:02:51 | 1 |
| 2021-03-24 06:03:22 | 1 |
| 2021-03-24 06:03:52 | 1 |
| 2021-03-24 06:04:23 | 1 |
| 2021-03-24 06:04:54 | 1 |
| 2021-03-24 06:05:24 | 1 |
| 2021-03-24 06:05:55 | 1 |
| 2021-03-24 06:06:26 | 1 |
| 2021-03-24 06:06:56 | 1 |
| 2021-03-24 06:07:27 | 1 |
| 2021-03-24 06:07:58 | 1 |
| 2021-03-24 06:08:28 | 1 |
| 2021-03-24 06:08:59 | 1 |
| 2021-03-24 06:09:30 | 1 |
| 2021-03-24 06:10:00 | 1 |
| 2021-03-24 06:10:31 | 1 |
| 2021-03-24 06:11:02 | 1 |
| 2021-03-24 06:11:33 | 1 |
| 2021-03-24 06:12:03 | 1 |
| 2021-03-24 06:12:34 | 1 |
| 2021-03-24 06:13:05 | 1 |
| 2021-03-24 06:13:35 | 1 |
| 2021-03-24 06:14:06 | 1 |
| 2021-03-24 06:14:37 | 1 |
| 2021-03-24 06:15:07 | 1 |
| 2021-03-24 06:15:38 | 1 |
| 2021-03-24 06:16:09 | 1 |
| 2021-03-24 06:16:39 | 1 |
| 2021-03-24 06:17:10 | 1 |
| 2021-03-24 06:17:41 | 1 |
| 2021-03-24 06:18:11 | 1 |
| 2021-03-24 06:18:42 | 1 |
| 2021-03-24 06:19:13 | 1 |
| 2021-03-24 06:19:43 | 1 |
| 2021-03-24 06:20:14 | 1 |
| 2021-03-24 06:20:45 | 1 |
| 2021-03-24 06:21:15 | 1 |
| 2021-03-24 06:21:46 | 1 |
| 2021-03-24 06:22:17 | 1 |
| 2021-03-24 06:22:47 | 1 |
| 2021-03-24 06:23:18 | 1 |
| 2021-03-24 06:23:49 | 1 |
| 2021-03-24 06:24:20 | 1 |
| 2021-03-24 06:24:50 | 1 |
| 2021-03-24 06:25:21 | 1 |
| 2021-03-24 06:25:52 | 1 |
| 2021-03-24 06:26:22 | 1 |
| 2021-03-24 06:26:53 | 1 |
| 2021-03-24 06:27:24 | 1 |
| 2021-03-24 06:27:54 | 1 |
| 2021-03-24 06:28:25 | 1 |
| 2021-03-24 06:28:56 | 1 |
| 2021-03-24 06:29:26 | 1 |
| 2021-03-24 06:29:57 | 1 |
| 2021-03-24 06:30:28 | 1 |
| 2021-03-24 06:30:58 | 1 |
| 2021-03-24 06:31:29 | 1 |
| 2021-03-24 06:32:00 | 1 |
| 2021-03-24 06:32:30 | 1 |
| 2021-03-24 06:33:01 | 1 |
| 2021-03-24 06:33:32 | 1 |
| 2021-03-24 06:34:02 | 1 |
| 2021-03-24 06:34:33 | 1 |
| 2021-03-24 06:35:04 | 1 |
| 2021-03-24 06:35:34 | 1 |
| 2021-03-24 06:36:05 | 1 |
| 2021-03-24 06:36:36 | 1 |
| 2021-03-24 06:37:07 | 1 |
| 2021-03-24 06:37:37 | 1 |
| 2021-03-24 06:38:08 | 1 |
| 2021-03-24 06:38:39 | 1 |
| 2021-03-24 06:39:09 | 1 |
| 2021-03-24 06:39:40 | 1 |
| 2021-03-24 06:40:11 | 1 |
| 2021-03-24 06:40:41 | 1 |
| 2021-03-24 06:41:12 | 1 |
| 2021-03-24 06:41:43 | 1 |
| 2021-03-24 06:42:13 | 1 |
| 2021-03-24 06:42:44 | 1 |
| 2021-03-24 06:43:15 | 1 |
| 2021-03-24 06:43:45 | 1 |
| 2021-03-24 06:44:16 | 1 |
| 2021-03-24 06:44:47 | 1 |
| 2021-03-24 06:45:17 | 1 |
| 2021-03-24 06:45:48 | 1 |
| 2021-03-24 06:46:19 | 1 |
| 2021-03-24 06:46:49 | 1 |
| 2021-03-24 06:47:20 | 1 |
| 2021-03-24 06:47:51 | 1 |
| 2021-03-24 06:48:21 | 1 |
| 2021-03-24 06:48:52 | 1 |
| 2021-03-24 06:49:23 | 1 |
| 2021-03-24 06:49:54 | 1 |
| 2021-03-24 06:50:24 | 1 |
| 2021-03-24 06:50:55 | 1 |
| 2021-03-24 06:51:26 | 1 |
| 2021-03-24 06:51:56 | 1 |
| 2021-03-24 06:52:27 | 1 |
| 2021-03-24 06:52:58 | 1 |
| 2021-03-24 06:53:28 | 1 |
| 2021-03-24 06:53:59 | 1 |
| 2021-03-24 06:54:30 | 1 |
| 2021-03-24 06:55:00 | 1 |
| 2021-03-24 06:55:31 | 1 |
| 2021-03-24 06:56:02 | 1 |
| 2021-03-24 06:56:32 | 1 |
| 2021-03-24 06:57:03 | 1 |
| 2021-03-24 06:57:34 | 1 |
| 2021-03-24 06:58:04 | 1 |
| 2021-03-24 06:58:35 | 1 |
| 2021-03-24 06:59:06 | 1 |
| 2021-03-24 06:59:36 | 1 |
| 2021-03-24 07:00:07 | 1 |
| 2021-03-24 07:00:38 | 1 |
| 2021-03-24 07:01:08 | 1 |
| 2021-03-24 07:01:39 | 1 |
| 2021-03-24 07:02:10 | 1 |
| 2021-03-24 07:02:40 | 1 |
| 2021-03-24 07:03:11 | 1 |
| 2021-03-24 07:03:42 | 1 |
| 2021-03-24 07:04:13 | 1 |
| 2021-03-24 07:04:43 | 1 |
| 2021-03-24 07:05:14 | 1 |
| 2021-03-24 07:05:45 | 1 |
| 2021-03-24 07:06:15 | 1 |
| 2021-03-24 07:06:46 | 1 |
| 2021-03-24 07:07:17 | 1 |
| 2021-03-24 07:07:47 | 1 |
| 2021-03-24 07:08:18 | 1 |
| 2021-03-24 07:08:49 | 1 |
| 2021-03-24 07:09:19 | 1 |
| 2021-03-24 07:09:50 | 1 |
| 2021-03-24 07:10:21 | 1 |
| 2021-03-24 07:10:51 | 1 |
| 2021-03-24 07:11:22 | 1 |
| 2021-03-24 07:11:53 | 1 |
| 2021-03-24 07:12:23 | 1 |
| 2021-03-24 07:12:54 | 1 |
| 2021-03-24 07:13:25 | 1 |
| 2021-03-24 07:13:55 | 1 |
| 2021-03-24 07:14:26 | 1 |
| 2021-03-24 07:14:57 | 1 |
| 2021-03-24 07:15:27 | 1 |
| 2021-03-24 07:15:58 | 1 |
| 2021-03-24 07:16:29 | 1 |
| 2021-03-24 07:16:59 | 1 |
| 2021-03-24 07:17:30 | 1 |
| 2021-03-24 07:18:01 | 1 |
| 2021-03-24 07:18:32 | 1 |
| 2021-03-24 07:19:02 | 1 |
| 2021-03-24 07:19:33 | 1 |
| 2021-03-24 07:20:04 | 1 |
| 2021-03-24 07:20:34 | 1 |
| 2021-03-24 07:21:05 | 1 |
| 2021-03-24 07:21:36 | 1 |
| 2021-03-24 07:22:06 | 1 |
| 2021-03-24 07:22:37 | 1 |
| 2021-03-24 07:23:08 | 1 |
| 2021-03-24 07:23:38 | 1 |
| 2021-03-24 07:24:09 | 1 |
| 2021-03-24 07:24:40 | 1 |
| 2021-03-24 07:25:10 | 1 |
| 2021-03-24 07:25:41 | 1 |
| 2021-03-24 07:26:12 | 1 |
| 2021-03-24 07:26:42 | 1 |
| 2021-03-24 07:27:13 | 1 |
| 2021-03-24 07:27:44 | 1 |
| 2021-03-24 07:28:14 | 1 |
| 2021-03-24 07:28:45 | 1 |
| 2021-03-24 07:29:16 | 1 |
| 2021-03-24 07:29:46 | 1 |
| 2021-03-24 07:30:17 | 1 |
| 2021-03-24 07:30:48 | 1 |
| 2021-03-24 07:31:19 | 1 |
| 2021-03-24 07:31:49 | 1 |
| 2021-03-24 07:32:20 | 1 |
| 2021-03-24 07:32:51 | 1 |
| 2021-03-24 07:33:21 | 1 |
| 2021-03-24 07:33:52 | 1 |
| 2021-03-24 07:34:23 | 1 |
| 2021-03-24 07:34:53 | 1 |
| 2021-03-24 07:35:24 | 1 |
| 2021-03-24 07:35:55 | 1 |
| 2021-03-24 07:36:25 | 1 |
| 2021-03-24 07:36:56 | 1 |
| 2021-03-24 07:37:27 | 1 |
| 2021-03-24 07:37:57 | 1 |
| 2021-03-24 07:38:28 | 1 |
| 2021-03-24 07:38:59 | 1 |
| 2021-03-24 07:39:29 | 1 |
| 2021-03-24 07:40:00 | 1 |
| 2021-03-24 07:40:31 | 1 |
| 2021-03-24 07:41:01 | 1 |
| 2021-03-24 07:41:32 | 1 |
| 2021-03-24 07:42:03 | 1 |
| 2021-03-24 07:42:33 | 1 |
| 2021-03-24 07:43:04 | 1 |
| 2021-03-24 07:43:35 | 1 |
| 2021-03-24 07:44:06 | 1 |
| 2021-03-24 07:44:36 | 1 |
| 2021-03-24 07:45:07 | 1 |
| 2021-03-24 07:45:38 | 1 |
| 2021-03-24 07:46:08 | 1 |
| 2021-03-24 07:46:39 | 1 |
| 2021-03-24 07:47:10 | 1 |
| 2021-03-24 07:47:40 | 1 |
| 2021-03-24 07:48:11 | 1 |
| 2021-03-24 07:48:42 | 1 |
| 2021-03-24 07:49:12 | 1 |
| 2021-03-24 07:49:43 | 1 |
| 2021-03-24 07:50:14 | 1 |
| 2021-03-24 07:50:44 | 1 |
| 2021-03-24 07:51:15 | 1 |
| 2021-03-24 07:51:46 | 1 |
| 2021-03-24 07:52:16 | 1 |
| 2021-03-24 07:52:47 | 1 |
| 2021-03-24 07:53:18 | 1 |
| 2021-03-24 07:53:48 | 1 |
| 2021-03-24 07:54:19 | 1 |
| 2021-03-24 07:54:50 | 1 |
| 2021-03-24 07:55:20 | 1 |
| 2021-03-24 07:55:51 | 1 |
| 2021-03-24 07:56:22 | 1 |
| 2021-03-24 07:56:53 | 1 |
| 2021-03-24 07:57:23 | 1 |
| 2021-03-24 07:57:54 | 1 |
| 2021-03-24 07:58:25 | 1 |
| 2021-03-24 07:58:55 | 1 |
| 2021-03-24 07:59:26 | 1 |
| 2021-03-24 07:59:57 | 1 |
| 2021-03-24 08:00:27 | 1 |
| 2021-03-24 08:00:58 | 1 |
| 2021-03-24 08:01:29 | 1 |
| 2021-03-24 08:01:59 | 1 |
| 2021-03-24 08:02:30 | 1 |
| 2021-03-24 08:03:01 | 1 |
| 2021-03-24 08:03:31 | 1 |
| 2021-03-24 08:04:02 | 1 |
| 2021-03-24 08:04:33 | 1 |
| 2021-03-24 08:05:03 | 1 |
| 2021-03-24 08:05:34 | 1 |
| 2021-03-24 08:06:05 | 1 |
| 2021-03-24 08:06:35 | 1 |
| 2021-03-24 08:07:06 | 1 |
| 2021-03-24 08:07:37 | 1 |
| 2021-03-24 08:08:07 | 1 |
| 2021-03-24 08:08:38 | 1 |
| 2021-03-24 08:09:09 | 1 |
| 2021-03-24 08:09:39 | 1 |
| 2021-03-24 08:10:10 | 1 |
| 2021-03-24 08:10:41 | 1 |
| 2021-03-24 08:11:12 | 1 |
| 2021-03-24 08:11:42 | 1 |
| 2021-03-24 08:12:13 | 1 |
| 2021-03-24 08:12:44 | 1 |
| 2021-03-24 08:13:14 | 1 |
| 2021-03-24 08:13:45 | 1 |
| 2021-03-24 08:14:16 | 1 |
| 2021-03-24 08:14:46 | 1 |
| 2021-03-24 08:15:17 | 1 |
| 2021-03-24 08:15:48 | 1 |
| 2021-03-24 08:16:18 | 1 |
| 2021-03-24 08:16:49 | 1 |
| 2021-03-24 08:17:20 | 1 |
| 2021-03-24 08:17:50 | 1 |
| 2021-03-24 08:18:21 | 1 |
| 2021-03-24 08:18:52 | 1 |
| 2021-03-24 08:19:22 | 1 |
| 2021-03-24 08:19:53 | 1 |
| 2021-03-24 08:20:24 | 1 |
| 2021-03-24 08:20:54 | 1 |
| 2021-03-24 08:21:25 | 1 |
| 2021-03-24 08:21:56 | 1 |
| 2021-03-24 08:22:26 | 1 |
| 2021-03-24 08:22:57 | 1 |
| 2021-03-24 08:23:28 | 1 |
| 2021-03-24 08:23:58 | 1 |
| 2021-03-24 08:24:29 | 1 |
| 2021-03-24 08:25:00 | 1 |
| 2021-03-24 08:25:30 | 1 |
| 2021-03-24 08:26:01 | 1 |
| 2021-03-24 08:26:32 | 1 |
| 2021-03-24 08:27:02 | 1 |
| 2021-03-24 08:27:33 | 1 |
| 2021-03-24 08:28:04 | 1 |
| 2021-03-24 08:28:35 | 1 |
| 2021-03-24 08:29:05 | 1 |
| 2021-03-24 08:29:36 | 1 |
| 2021-03-24 08:30:07 | 1 |
| 2021-03-24 08:30:37 | 1 |
| 2021-03-24 08:31:08 | 1 |
| 2021-03-24 08:31:39 | 1 |
| 2021-03-24 08:32:09 | 1 |
| 2021-03-24 08:32:40 | 1 |
| 2021-03-24 08:33:11 | 1 |
| 2021-03-24 08:33:41 | 1 |
| 2021-03-24 08:34:12 | 1 |
| 2021-03-24 08:34:43 | 1 |
| 2021-03-24 08:35:13 | 1 |
| 2021-03-24 08:35:44 | 1 |
| 2021-03-24 08:36:15 | 1 |
| 2021-03-24 08:36:45 | 1 |
| 2021-03-24 08:37:16 | 1 |
| 2021-03-24 08:37:47 | 1 |
| 2021-03-24 08:38:17 | 1 |
| 2021-03-24 08:38:48 | 1 |
| 2021-03-24 08:39:19 | 1 |
| 2021-03-24 08:39:49 | 1 |
| 2021-03-24 08:40:20 | 1 |
| 2021-03-24 08:40:51 | 1 |
| 2021-03-24 08:41:21 | 1 |
| 2021-03-24 08:41:52 | 1 |
| 2021-03-24 08:42:23 | 1 |
| 2021-03-24 08:42:53 | 1 |
| 2021-03-24 08:43:24 | 1 |
| 2021-03-24 08:43:55 | 1 |
| 2021-03-24 08:44:26 | 1 |
| 2021-03-24 08:44:56 | 1 |
| 2021-03-24 08:45:27 | 1 |
| 2021-03-24 08:45:58 | 1 |
| 2021-03-24 08:46:28 | 1 |
| 2021-03-24 08:46:59 | 1 |
| 2021-03-24 08:47:30 | 1 |
| 2021-03-24 08:48:00 | 1 |
| 2021-03-24 08:48:31 | 1 |
| 2021-03-24 08:49:02 | 1 |
| 2021-03-24 08:49:32 | 1 |
| 2021-03-24 08:50:03 | 1 |
| 2021-03-24 08:50:34 | 1 |
| 2021-03-24 08:51:04 | 1 |
| 2021-03-24 08:51:35 | 1 |
| 2021-03-24 08:52:06 | 1 |
| 2021-03-24 08:52:36 | 1 |
| 2021-03-24 08:53:07 | 1 |
| 2021-03-24 08:53:38 | 1 |
| 2021-03-24 08:54:08 | 1 |
| 2021-03-24 08:54:39 | 1 |
| 2021-03-24 08:55:10 | 1 |
| 2021-03-24 08:55:40 | 1 |
| 2021-03-24 08:56:11 | 1 |
| 2021-03-24 08:56:42 | 1 |
| 2021-03-24 08:57:12 | 1 |
| 2021-03-24 08:57:43 | 1 |
| 2021-03-24 08:58:14 | 1 |
| 2021-03-24 08:58:44 | 1 |
| 2021-03-24 08:59:15 | 1 |
| 2021-03-24 08:59:46 | 1 |
| 2021-03-24 09:00:17 | 1 |
| 2021-03-24 09:00:47 | 1 |
| 2021-03-24 09:01:18 | 1 |
| 2021-03-24 09:01:49 | 1 |
| 2021-03-24 09:02:19 | 1 |
| 2021-03-24 09:02:50 | 1 |
| 2021-03-24 09:03:21 | 1 |
| 2021-03-24 09:03:51 | 1 |
| 2021-03-24 09:04:22 | 1 |
| 2021-03-24 09:04:53 | 1 |
| 2021-03-24 09:05:23 | 1 |
| 2021-03-24 09:05:54 | 1 |
| 2021-03-24 09:06:25 | 1 |
| 2021-03-24 09:06:55 | 1 |
| 2021-03-24 09:07:26 | 1 |
| 2021-03-24 09:07:57 | 1 |
| 2021-03-24 09:08:27 | 1 |
| 2021-03-24 09:08:58 | 1 |
| 2021-03-24 09:09:29 | 1 |
| 2021-03-24 09:09:59 | 1 |
| 2021-03-24 09:10:30 | 1 |
| 2021-03-24 09:11:01 | 1 |
| 2021-03-24 09:11:31 | 1 |
| 2021-03-24 09:12:02 | 1 |
| 2021-03-24 09:12:33 | 1 |
| 2021-03-24 09:13:03 | 1 |
| 2021-03-24 09:13:34 | 1 |
| 2021-03-24 09:14:05 | 1 |
| 2021-03-24 09:14:35 | 1 |
| 2021-03-24 09:15:06 | 1 |
| 2021-03-24 09:15:37 | 1 |
| 2021-03-24 09:16:07 | 1 |
| 2021-03-24 09:16:38 | 1 |
| 2021-03-24 09:17:09 | 1 |
| 2021-03-24 09:17:40 | 1 |
| 2021-03-24 09:18:10 | 1 |
| 2021-03-24 09:18:41 | 1 |
| 2021-03-24 09:19:12 | 1 |
| 2021-03-24 09:19:42 | 1 |
| 2021-03-24 09:20:13 | 1 |
| 2021-03-24 09:20:44 | 1 |
| 2021-03-24 09:21:14 | 1 |
| 2021-03-24 09:21:45 | 1 |
| 2021-03-24 09:22:16 | 1 |
| 2021-03-24 09:22:46 | 1 |
| 2021-03-24 09:23:17 | 1 |
| 2021-03-24 09:23:48 | 1 |
| 2021-03-24 09:24:18 | 1 |
| 2021-03-24 09:24:49 | 1 |
| 2021-03-24 09:25:20 | 1 |
| 2021-03-24 09:25:50 | 1 |
| 2021-03-24 09:26:21 | 1 |
| 2021-03-24 09:26:52 | 1 |
| 2021-03-24 09:27:22 | 1 |
| 2021-03-24 09:27:53 | 1 |
| 2021-03-24 09:28:24 | 1 |
| 2021-03-24 09:28:54 | 1 |
| 2021-03-24 09:29:25 | 1 |
| 2021-03-24 09:29:56 | 1 |
| 2021-03-24 09:30:26 | 1 |
| 2021-03-24 09:30:57 | 1 |
| 2021-03-24 09:31:28 | 1 |
| 2021-03-24 09:31:59 | 1 |
| 2021-03-24 09:32:29 | 1 |
| 2021-03-24 09:33:00 | 1 |
| 2021-03-24 09:33:31 | 1 |
| 2021-03-24 09:34:01 | 1 |
| 2021-03-24 09:34:32 | 1 |
| 2021-03-24 09:35:03 | 1 |
| 2021-03-24 09:35:33 | 1 |
| 2021-03-24 09:36:04 | 1 |
| 2021-03-24 09:36:35 | 1 |
| 2021-03-24 09:37:05 | 1 |
| 2021-03-24 09:37:36 | 1 |
| 2021-03-24 09:38:07 | 1 |
| 2021-03-24 09:38:37 | 1 |
| 2021-03-24 09:39:08 | 1 |
| 2021-03-24 09:39:39 | 1 |
| 2021-03-24 09:40:09 | 1 |
| 2021-03-24 09:40:40 | 1 |
| 2021-03-24 09:41:11 | 1 |
| 2021-03-24 09:41:41 | 1 |
| 2021-03-24 09:42:12 | 1 |
| 2021-03-24 09:42:43 | 1 |
| 2021-03-24 09:43:13 | 1 |
| 2021-03-24 09:43:44 | 1 |
| 2021-03-24 09:44:15 | 1 |
| 2021-03-24 09:44:45 | 1 |
| 2021-03-24 09:45:16 | 1 |
| 2021-03-24 09:45:47 | 1 |
| 2021-03-24 09:46:17 | 1 |
| 2021-03-24 09:46:48 | 1 |
| 2021-03-24 09:47:19 | 1 |
| 2021-03-24 09:47:49 | 1 |
| 2021-03-24 09:48:20 | 1 |
| 2021-03-24 09:48:51 | 1 |
| 2021-03-24 09:49:21 | 1 |
| 2021-03-24 09:49:52 | 1 |
| 2021-03-24 09:50:23 | 1 |
| 2021-03-24 09:50:54 | 1 |
| 2021-03-24 09:51:24 | 1 |
| 2021-03-24 09:51:55 | 1 |
| 2021-03-24 09:52:26 | 1 |
| 2021-03-24 09:52:56 | 1 |
| 2021-03-24 09:53:27 | 1 |
| 2021-03-24 09:53:58 | 1 |
| 2021-03-24 09:54:28 | 1 |
| 2021-03-24 09:54:59 | 1 |
| 2021-03-24 09:55:30 | 1 |
| 2021-03-24 09:56:00 | 1 |
| 2021-03-24 09:56:31 | 1 |
| 2021-03-24 09:57:02 | 1 |
| 2021-03-24 09:57:32 | 1 |
| 2021-03-24 09:58:03 | 1 |
| 2021-03-24 09:58:34 | 1 |
| 2021-03-24 09:59:04 | 1 |
| 2021-03-24 09:59:35 | 1 |
| 2021-03-24 10:00:06 | 1 |
| 2021-03-24 10:00:36 | 1 |
| 2021-03-24 10:01:07 | 1 |
| 2021-03-24 10:01:38 | 1 |
| 2021-03-24 10:02:08 | 1 |
| 2021-03-24 10:02:39 | 1 |
| 2021-03-24 10:03:10 | 1 |
| 2021-03-24 10:03:40 | 1 |
| 2021-03-24 10:04:11 | 1 |
| 2021-03-24 10:04:42 | 1 |
| 2021-03-24 10:05:12 | 1 |
| 2021-03-24 10:05:43 | 1 |
| 2021-03-24 10:06:14 | 1 |
| 2021-03-24 10:06:44 | 1 |
| 2021-03-24 10:07:15 | 1 |
| 2021-03-24 10:07:46 | 1 |
| 2021-03-24 10:08:16 | 1 |
| 2021-03-24 10:08:47 | 1 |
| 2021-03-24 10:09:18 | 1 |
| 2021-03-24 10:09:49 | 1 |
| 2021-03-24 10:10:19 | 1 |
| 2021-03-24 10:10:50 | 1 |
| 2021-03-24 10:11:21 | 1 |
| 2021-03-24 10:11:51 | 1 |
| 2021-03-24 10:12:22 | 1 |
| 2021-03-24 10:12:53 | 1 |
| 2021-03-24 10:13:23 | 1 |
| 2021-03-24 10:13:54 | 1 |
| 2021-03-24 10:14:25 | 1 |
| 2021-03-24 10:14:55 | 1 |
| 2021-03-24 10:15:26 | 1 |
| 2021-03-24 10:15:57 | 1 |
| 2021-03-24 10:16:27 | 1 |
| 2021-03-24 10:16:58 | 1 |
| 2021-03-24 10:17:29 | 1 |
| 2021-03-24 10:17:59 | 1 |
| 2021-03-24 10:18:30 | 1 |
| 2021-03-24 10:19:01 | 1 |
| 2021-03-24 10:19:31 | 1 |
| 2021-03-24 10:20:02 | 1 |
| 2021-03-24 10:20:33 | 1 |
| 2021-03-24 10:21:03 | 1 |
| 2021-03-24 10:21:34 | 1 |
| 2021-03-24 10:22:05 | 1 |
| 2021-03-24 10:22:35 | 1 |
| 2021-03-24 10:23:06 | 1 |
| 2021-03-24 10:23:37 | 1 |
| 2021-03-24 10:24:07 | 1 |
| 2021-03-24 10:24:38 | 1 |
| 2021-03-24 10:25:09 | 1 |
| 2021-03-24 10:25:39 | 1 |
| 2021-03-24 10:26:10 | 1 |
| 2021-03-24 10:26:41 | 1 |
| 2021-03-24 10:27:11 | 1 |
| 2021-03-24 10:27:42 | 1 |
| 2021-03-24 10:28:13 | 1 |
| 2021-03-24 10:28:43 | 1 |
| 2021-03-24 10:29:14 | 1 |
| 2021-03-24 10:29:45 | 1 |
| 2021-03-24 10:30:15 | 1 |
| 2021-03-24 10:30:46 | 1 |
| 2021-03-24 10:31:17 | 1 |
| 2021-03-24 10:31:47 | 1 |
| 2021-03-24 10:32:18 | 1 |
| 2021-03-24 10:32:49 | 1 |
| 2021-03-24 10:33:19 | 1 |
| 2021-03-24 10:33:50 | 1 |
| 2021-03-24 10:34:21 | 1 |
| 2021-03-24 10:34:52 | 1 |
| 2021-03-24 10:35:22 | 1 |
| 2021-03-24 10:35:53 | 1 |
| 2021-03-24 10:36:24 | 1 |
| 2021-03-24 10:36:54 | 1 |
| 2021-03-24 10:37:25 | 1 |
| 2021-03-24 10:37:56 | 1 |
| 2021-03-24 10:38:26 | 1 |
| 2021-03-24 10:38:57 | 1 |
| 2021-03-24 10:39:28 | 1 |
| 2021-03-24 10:39:58 | 1 |
| 2021-03-24 10:40:29 | 1 |
| 2021-03-24 10:41:00 | 1 |
| 2021-03-24 10:41:30 | 1 |
| 2021-03-24 10:42:01 | 1 |
| 2021-03-24 10:42:32 | 1 |
| 2021-03-24 10:43:02 | 1 |
| 2021-03-24 10:43:33 | 1 |
| 2021-03-24 10:44:04 | 1 |
| 2021-03-24 10:44:34 | 1 |
| 2021-03-24 10:45:05 | 1 |
| 2021-03-24 10:45:36 | 1 |
| 2021-03-24 10:46:06 | 1 |
| 2021-03-24 10:46:37 | 1 |
| 2021-03-24 10:47:08 | 1 |
| 2021-03-24 10:47:38 | 1 |
| 2021-03-24 10:48:09 | 1 |
| 2021-03-24 10:48:40 | 1 |
| 2021-03-24 10:49:10 | 1 |
| 2021-03-24 10:49:41 | 1 |
| 2021-03-24 10:50:12 | 1 |
| 2021-03-24 10:50:42 | 1 |
| 2021-03-24 10:51:13 | 1 |
| 2021-03-24 10:51:44 | 1 |
| 2021-03-24 10:52:15 | 1 |
| 2021-03-24 10:52:45 | 1 |
| 2021-03-24 10:53:16 | 1 |
| 2021-03-24 10:53:47 | 1 |
| 2021-03-24 10:54:17 | 1 |
| 2021-03-24 10:54:48 | 1 |
| 2021-03-24 10:55:19 | 1 |
| 2021-03-24 10:55:49 | 1 |
| 2021-03-24 10:56:20 | 1 |
| 2021-03-24 10:56:51 | 1 |
| 2021-03-24 10:57:21 | 1 |
| 2021-03-24 10:57:52 | 1 |
| 2021-03-24 10:58:23 | 1 |
| 2021-03-24 10:58:53 | 1 |
| 2021-03-24 10:59:24 | 1 |
| 2021-03-24 10:59:55 | 1 |
| 2021-03-24 11:00:25 | 1 |
| 2021-03-24 11:00:56 | 1 |
| 2021-03-24 11:01:27 | 1 |
| 2021-03-24 11:01:57 | 1 |
| 2021-03-24 11:02:28 | 1 |
| 2021-03-24 11:02:59 | 1 |
| 2021-03-24 11:03:29 | 1 |
| 2021-03-24 11:04:00 | 1 |
| 2021-03-24 11:04:31 | 1 |
| 2021-03-24 11:05:01 | 1 |
| 2021-03-24 11:05:32 | 1 |
| 2021-03-24 11:06:03 | 1 |
| 2021-03-24 11:06:34 | 1 |
| 2021-03-24 11:07:04 | 1 |
| 2021-03-24 11:07:35 | 1 |
| 2021-03-24 11:08:06 | 1 |
| 2021-03-24 11:08:36 | 1 |
| 2021-03-24 11:09:07 | 1 |
| 2021-03-24 11:09:38 | 1 |
| 2021-03-24 11:10:08 | 1 |
| 2021-03-24 11:10:39 | 1 |
| 2021-03-24 11:11:10 | 1 |
| 2021-03-24 11:11:40 | 1 |
| 2021-03-24 11:12:11 | 1 |
| 2021-03-24 11:12:42 | 1 |
| 2021-03-24 11:13:12 | 1 |
| 2021-03-24 11:13:43 | 1 |
| 2021-03-24 11:14:14 | 1 |
| 2021-03-24 11:14:44 | 1 |
| 2021-03-24 11:15:15 | 1 |
| 2021-03-24 11:15:46 | 1 |
| 2021-03-24 11:16:16 | 1 |
| 2021-03-24 11:16:47 | 1 |
| 2021-03-24 11:17:18 | 1 |
| 2021-03-24 11:17:48 | 1 |
| 2021-03-24 11:18:19 | 1 |
| 2021-03-24 11:18:50 | 1 |
| 2021-03-24 11:19:20 | 1 |
| 2021-03-24 11:19:51 | 1 |
| 2021-03-24 11:20:22 | 1 |
| 2021-03-24 11:20:53 | 1 |
| 2021-03-24 11:21:23 | 1 |
| 2021-03-24 11:21:54 | 1 |
| 2021-03-24 11:22:25 | 1 |
| 2021-03-24 11:22:55 | 1 |
| 2021-03-24 11:23:26 | 1 |
| 2021-03-24 11:23:57 | 1 |
| 2021-03-24 11:24:27 | 1 |
| 2021-03-24 11:24:58 | 1 |
| 2021-03-24 11:25:29 | 1 |
| 2021-03-24 11:25:59 | 1 |
| 2021-03-24 11:26:30 | 1 |
| 2021-03-24 11:27:01 | 1 |
| 2021-03-24 11:27:31 | 1 |
| 2021-03-24 11:28:02 | 1 |
| 2021-03-24 11:28:33 | 1 |
| 2021-03-24 11:29:03 | 1 |
| 2021-03-24 11:29:34 | 1 |
| 2021-03-24 11:30:05 | 1 |
| 2021-03-24 11:30:35 | 1 |
| 2021-03-24 11:31:06 | 1 |
| 2021-03-24 11:31:37 | 1 |
| 2021-03-24 11:32:07 | 1 |
| 2021-03-24 11:32:38 | 1 |
| 2021-03-24 11:33:09 | 1 |
| 2021-03-24 11:33:39 | 1 |
| 2021-03-24 11:34:10 | 1 |
| 2021-03-24 11:34:41 | 1 |
| 2021-03-24 11:35:12 | 1 |
| 2021-03-24 11:35:42 | 1 |
| 2021-03-24 11:36:13 | 1 |
| 2021-03-24 11:36:44 | 1 |
| 2021-03-24 11:37:14 | 1 |
| 2021-03-24 11:37:45 | 1 |
| 2021-03-24 11:38:16 | 1 |
| 2021-03-24 11:38:46 | 1 |
| 2021-03-24 11:39:17 | 1 |
| 2021-03-24 11:39:48 | 1 |
| 2021-03-24 11:40:18 | 1 |
| 2021-03-24 11:40:49 | 1 |
| 2021-03-24 11:41:20 | 1 |
| 2021-03-24 11:41:50 | 1 |
| 2021-03-24 11:42:21 | 1 |
| 2021-03-24 11:42:52 | 1 |
| 2021-03-24 11:43:22 | 1 |
| 2021-03-24 11:43:53 | 1 |
| 2021-03-24 11:44:24 | 1 |
| 2021-03-24 11:44:54 | 1 |
| 2021-03-24 11:45:25 | 1 |
| 2021-03-24 11:45:56 | 1 |
| 2021-03-24 11:46:26 | 1 |
| 2021-03-24 11:46:57 | 1 |
| 2021-03-24 11:47:28 | 1 |
| 2021-03-24 11:47:58 | 1 |
| 2021-03-24 11:48:29 | 1 |
| 2021-03-24 11:49:00 | 1 |
| 2021-03-24 11:49:31 | 1 |
| 2021-03-24 11:50:01 | 1 |
| 2021-03-24 11:50:32 | 1 |
| 2021-03-24 11:51:03 | 1 |
| 2021-03-24 11:51:33 | 1 |
| 2021-03-24 11:52:04 | 1 |
| 2021-03-24 11:52:35 | 1 |
| 2021-03-24 11:53:05 | 1 |
| 2021-03-24 11:53:36 | 1 |
| 2021-03-24 11:54:07 | 1 |
| 2021-03-24 11:54:37 | 1 |
| 2021-03-24 11:55:08 | 1 |
| 2021-03-24 11:55:39 | 1 |
| 2021-03-24 11:56:09 | 1 |
| 2021-03-24 11:56:40 | 1 |
| 2021-03-24 11:57:11 | 1 |
| 2021-03-24 11:57:41 | 1 |
| 2021-03-24 11:58:12 | 1 |
| 2021-03-24 11:58:43 | 1 |
| 2021-03-24 11:59:13 | 1 |
| 2021-03-24 11:59:44 | 1 |
| 2021-03-24 12:00:15 | 1 |
| 2021-03-24 12:00:45 | 1 |
| 2021-03-24 12:01:16 | 1 |
| 2021-03-24 12:01:47 | 1 |
| 2021-03-24 12:02:18 | 1 |
| 2021-03-24 12:02:48 | 1 |
| 2021-03-24 12:03:19 | 1 |
| 2021-03-24 12:03:50 | 1 |
| 2021-03-24 12:04:20 | 1 |
| 2021-03-24 12:04:51 | 1 |
| 2021-03-24 12:05:22 | 1 |
| 2021-03-24 12:05:52 | 1 |
| 2021-03-24 12:06:23 | 1 |
| 2021-03-24 12:06:54 | 1 |
| 2021-03-24 12:07:24 | 1 |
| 2021-03-24 12:07:55 | 1 |
| 2021-03-24 12:08:26 | 1 |
| 2021-03-24 12:08:56 | 1 |
| 2021-03-24 12:09:27 | 1 |
| 2021-03-24 12:09:58 | 1 |
| 2021-03-24 12:10:28 | 1 |
| 2021-03-24 12:10:59 | 1 |
| 2021-03-24 12:11:30 | 1 |
| 2021-03-24 12:12:00 | 1 |
| 2021-03-24 12:12:31 | 1 |
| 2021-03-24 12:13:02 | 1 |
| 2021-03-24 12:13:32 | 1 |
| 2021-03-24 12:14:03 | 1 |
| 2021-03-24 12:14:34 | 1 |
| 2021-03-24 12:15:04 | 1 |
| 2021-03-24 12:15:35 | 1 |
| 2021-03-24 12:16:06 | 1 |
| 2021-03-24 12:16:36 | 1 |
| 2021-03-24 12:17:07 | 1 |
| 2021-03-24 12:17:38 | 1 |
| 2021-03-24 12:18:09 | 1 |
| 2021-03-24 12:18:39 | 1 |
| 2021-03-24 12:19:10 | 1 |
| 2021-03-24 12:19:41 | 1 |
| 2021-03-24 12:20:11 | 1 |
| 2021-03-24 12:20:42 | 1 |
| 2021-03-24 12:21:13 | 1 |
| 2021-03-24 12:21:43 | 1 |
| 2021-03-24 12:22:14 | 1 |
| 2021-03-24 12:22:45 | 1 |
| 2021-03-24 12:23:15 | 1 |
| 2021-03-24 12:23:46 | 1 |
| 2021-03-24 12:24:17 | 1 |
| 2021-03-24 12:24:47 | 1 |
| 2021-03-24 12:25:18 | 1 |
| 2021-03-24 12:25:49 | 1 |
| 2021-03-24 12:26:19 | 1 |
| 2021-03-24 12:26:50 | 1 |
| 2021-03-24 12:27:21 | 1 |
| 2021-03-24 12:27:51 | 1 |
| 2021-03-24 12:28:22 | 1 |
| 2021-03-24 12:28:53 | 1 |
| 2021-03-24 12:29:23 | 1 |
| 2021-03-24 12:29:54 | 1 |
| 2021-03-24 12:30:25 | 1 |
| 2021-03-24 12:30:55 | 1 |
| 2021-03-24 12:31:26 | 1 |
| 2021-03-24 12:31:57 | 1 |
| 2021-03-24 12:32:28 | 1 |
| 2021-03-24 12:32:58 | 1 |
| 2021-03-24 12:33:29 | 1 |
| 2021-03-24 12:34:00 | 1 |
| 2021-03-24 12:34:30 | 1 |
| 2021-03-24 12:35:01 | 1 |
| 2021-03-24 12:35:32 | 1 |
| 2021-03-24 12:36:02 | 1 |
| 2021-03-24 12:36:33 | 1 |
| 2021-03-24 12:37:04 | 1 |
| 2021-03-24 12:37:34 | 1 |
| 2021-03-24 12:38:05 | 1 |
| 2021-03-24 12:38:36 | 1 |
| 2021-03-24 12:39:06 | 1 |
| 2021-03-24 12:39:37 | 1 |
| 2021-03-24 12:40:08 | 1 |
| 2021-03-24 12:40:38 | 1 |
| 2021-03-24 12:41:09 | 1 |
| 2021-03-24 12:41:40 | 1 |
| 2021-03-24 12:42:10 | 1 |
| 2021-03-24 12:42:41 | 1 |
| 2021-03-24 12:43:12 | 1 |
| 2021-03-24 12:43:42 | 1 |
| 2021-03-24 12:44:13 | 1 |
| 2021-03-24 12:44:44 | 1 |
| 2021-03-24 12:45:15 | 1 |
| 2021-03-24 12:45:45 | 1 |
| 2021-03-24 12:46:16 | 1 |
| 2021-03-24 12:46:47 | 1 |
| 2021-03-24 12:47:17 | 1 |
| 2021-03-24 12:47:48 | 1 |
| 2021-03-24 12:48:19 | 1 |
| 2021-03-24 12:48:49 | 1 |
| 2021-03-24 12:49:20 | 1 |
| 2021-03-24 12:49:51 | 1 |
| 2021-03-24 12:50:21 | 1 |
| 2021-03-24 12:50:52 | 1 |
| 2021-03-24 12:51:23 | 1 |
| 2021-03-24 12:51:53 | 1 |
| 2021-03-24 12:52:24 | 1 |
| 2021-03-24 12:52:55 | 1 |
| 2021-03-24 12:53:25 | 1 |
| 2021-03-24 12:53:56 | 1 |
| 2021-03-24 12:54:27 | 1 |
| 2021-03-24 12:54:57 | 1 |
| 2021-03-24 12:55:28 | 1 |
| 2021-03-24 12:55:59 | 1 |
| 2021-03-24 12:56:29 | 1 |
| 2021-03-24 12:57:00 | 1 |
| 2021-03-24 12:57:31 | 1 |
| 2021-03-24 12:58:01 | 1 |
| 2021-03-24 12:58:32 | 1 |
| 2021-03-24 12:59:03 | 1 |
| 2021-03-24 12:59:34 | 1 |
| 2021-03-24 13:00:04 | 1 |
| 2021-03-24 13:00:35 | 1 |
| 2021-03-24 13:01:06 | 1 |
| 2021-03-24 13:01:36 | 1 |
| 2021-03-24 13:02:07 | 1 |
| 2021-03-24 13:02:38 | 1 |
| 2021-03-24 13:03:08 | 1 |
| 2021-03-24 13:03:39 | 1 |
| 2021-03-24 13:04:10 | 1 |
| 2021-03-24 13:04:40 | 1 |
| 2021-03-24 13:05:11 | 1 |
| 2021-03-24 13:05:42 | 1 |
| 2021-03-24 13:06:12 | 1 |
| 2021-03-24 13:06:43 | 1 |
| 2021-03-24 13:07:14 | 1 |
| 2021-03-24 13:07:44 | 1 |
| 2021-03-24 13:08:15 | 1 |
| 2021-03-24 13:08:46 | 1 |
| 2021-03-24 13:09:16 | 1 |
| 2021-03-24 13:09:47 | 1 |
| 2021-03-24 13:10:18 | 1 |
| 2021-03-24 13:10:48 | 1 |
| 2021-03-24 13:11:19 | 1 |
| 2021-03-24 13:11:50 | 1 |
| 2021-03-24 13:12:20 | 1 |
| 2021-03-24 13:12:51 | 1 |
| 2021-03-24 13:13:22 | 1 |
| 2021-03-24 13:13:53 | 1 |
| 2021-03-24 13:14:23 | 1 |
| 2021-03-24 13:14:54 | 1 |
| 2021-03-24 13:15:25 | 1 |
| 2021-03-24 13:15:55 | 1 |
| 2021-03-24 13:16:26 | 1 |
| 2021-03-24 13:16:57 | 1 |
| 2021-03-24 13:17:27 | 1 |
| 2021-03-24 13:17:58 | 1 |
| 2021-03-24 13:18:29 | 1 |
| 2021-03-24 13:18:59 | 1 |
| 2021-03-24 13:19:30 | 1 |
| 2021-03-24 13:20:01 | 1 |
| 2021-03-24 13:20:31 | 1 |
| 2021-03-24 13:21:02 | 1 |
| 2021-03-24 13:21:33 | 1 |
| 2021-03-24 13:22:03 | 1 |
| 2021-03-24 13:22:34 | 1 |
| 2021-03-24 13:23:05 | 1 |
| 2021-03-24 13:23:35 | 1 |
| 2021-03-24 13:24:06 | 1 |
| 2021-03-24 13:24:37 | 1 |
| 2021-03-24 13:25:07 | 1 |
| 2021-03-24 13:25:38 | 1 |
| 2021-03-24 13:26:09 | 1 |
| 2021-03-24 13:26:39 | 1 |
| 2021-03-24 13:27:10 | 1 |
| 2021-03-24 13:27:41 | 1 |
| 2021-03-24 13:28:12 | 1 |
| 2021-03-24 13:28:42 | 1 |
| 2021-03-24 13:29:13 | 1 |
| 2021-03-24 13:29:44 | 1 |
| 2021-03-24 13:30:14 | 1 |
| 2021-03-24 13:30:45 | 1 |
| 2021-03-24 13:31:16 | 1 |
| 2021-03-24 13:31:46 | 1 |
| 2021-03-24 13:32:17 | 1 |
| 2021-03-24 13:32:48 | 1 |
| 2021-03-24 13:33:18 | 1 |
| 2021-03-24 13:33:49 | 1 |
| 2021-03-24 13:34:20 | 1 |
| 2021-03-24 13:34:50 | 1 |
| 2021-03-24 13:35:21 | 1 |
| 2021-03-24 13:35:52 | 1 |
| 2021-03-24 13:36:22 | 1 |
| 2021-03-24 13:36:53 | 1 |
| 2021-03-24 13:37:24 | 1 |
| 2021-03-24 13:37:54 | 1 |
| 2021-03-24 13:38:25 | 1 |
| 2021-03-24 13:38:56 | 1 |
| 2021-03-24 13:39:26 | 1 |
| 2021-03-24 13:39:57 | 1 |
| 2021-03-24 13:40:28 | 1 |
| 2021-03-24 13:40:59 | 1 |
| 2021-03-24 13:41:29 | 1 |
| 2021-03-24 13:42:00 | 1 |
| 2021-03-24 13:42:31 | 1 |
| 2021-03-24 13:43:01 | 1 |
| 2021-03-24 13:43:32 | 1 |
| 2021-03-24 13:44:03 | 1 |
| 2021-03-24 13:44:33 | 1 |
| 2021-03-24 13:45:04 | 1 |
| 2021-03-24 13:45:35 | 1 |
| 2021-03-24 13:46:05 | 1 |
| 2021-03-24 13:46:36 | 1 |
| 2021-03-24 13:47:07 | 1 |
| 2021-03-24 13:47:37 | 1 |
| 2021-03-24 13:48:08 | 1 |
| 2021-03-24 13:48:39 | 1 |
| 2021-03-24 13:49:09 | 1 |
| 2021-03-24 13:49:40 | 1 |
| 2021-03-24 13:50:11 | 1 |
| 2021-03-24 13:50:41 | 1 |
| 2021-03-24 13:51:12 | 1 |
| 2021-03-24 13:51:43 | 1 |
| 2021-03-24 13:52:13 | 1 |
| 2021-03-24 13:52:44 | 1 |
| 2021-03-24 13:53:15 | 1 |
| 2021-03-24 13:53:45 | 1 |
| 2021-03-24 13:54:16 | 1 |
| 2021-03-24 13:54:47 | 1 |
| 2021-03-24 13:55:18 | 1 |
| 2021-03-24 13:55:48 | 1 |
| 2021-03-24 13:56:19 | 1 |
| 2021-03-24 13:56:50 | 1 |
| 2021-03-24 13:57:20 | 1 |
| 2021-03-24 13:57:51 | 1 |
| 2021-03-24 13:58:22 | 1 |
| 2021-03-24 13:58:52 | 1 |
| 2021-03-24 13:59:23 | 1 |
| 2021-03-24 13:59:54 | 1 |
| 2021-03-24 14:00:24 | 1 |
| 2021-03-24 14:00:55 | 1 |
| 2021-03-24 14:01:26 | 1 |
| 2021-03-24 14:01:56 | 1 |
| 2021-03-24 14:02:27 | 1 |
| 2021-03-24 14:02:58 | 1 |
| 2021-03-24 14:03:28 | 1 |
| 2021-03-24 14:03:59 | 1 |
| 2021-03-24 14:04:30 | 1 |
| 2021-03-24 14:05:00 | 1 |
| 2021-03-24 14:05:31 | 1 |
| 2021-03-24 14:06:02 | 1 |
| 2021-03-24 14:06:32 | 1 |
| 2021-03-24 14:07:03 | 1 |
| 2021-03-24 14:07:34 | 1 |
| 2021-03-24 14:08:04 | 1 |
| 2021-03-24 14:08:35 | 1 |
| 2021-03-24 14:09:06 | 1 |
| 2021-03-24 14:09:37 | 1 |
| 2021-03-24 14:10:07 | 1 |
| 2021-03-24 14:10:38 | 1 |
| 2021-03-24 14:11:09 | 1 |
| 2021-03-24 14:11:39 | 1 |
| 2021-03-24 14:12:10 | 1 |
| 2021-03-24 14:12:41 | 1 |
| 2021-03-24 14:13:11 | 1 |
| 2021-03-24 14:13:42 | 1 |
| 2021-03-24 14:14:13 | 1 |
| 2021-03-24 14:14:43 | 1 |
| 2021-03-24 14:15:14 | 1 |
| 2021-03-24 14:15:45 | 1 |
| 2021-03-24 14:16:15 | 1 |
| 2021-03-24 14:16:46 | 1 |
| 2021-03-24 14:17:17 | 1 |
| 2021-03-24 14:17:47 | 1 |
| 2021-03-24 14:18:18 | 1 |
| 2021-03-24 14:18:49 | 1 |
| 2021-03-24 14:19:19 | 1 |
| 2021-03-24 14:19:50 | 1 |
| 2021-03-24 14:20:21 | 1 |
| 2021-03-24 14:20:51 | 1 |
| 2021-03-24 14:21:22 | 1 |
| 2021-03-24 14:21:53 | 1 |
| 2021-03-24 14:22:24 | 1 |
| 2021-03-24 14:22:54 | 1 |
| 2021-03-24 14:23:25 | 1 |
| 2021-03-24 14:23:56 | 1 |
| 2021-03-24 14:24:26 | 1 |
| 2021-03-24 14:24:57 | 1 |
| 2021-03-24 14:25:28 | 1 |
| 2021-03-24 14:25:58 | 1 |
| 2021-03-24 14:26:29 | 1 |
| 2021-03-24 14:27:00 | 1 |
| 2021-03-24 14:27:30 | 1 |
| 2021-03-24 14:28:01 | 1 |
| 2021-03-24 14:28:32 | 1 |
| 2021-03-24 14:29:02 | 1 |
| 2021-03-24 14:29:33 | 1 |
| 2021-03-24 14:30:04 | 1 |
| 2021-03-24 14:30:34 | 1 |
| 2021-03-24 14:31:05 | 1 |
| 2021-03-24 14:31:36 | 1 |
| 2021-03-24 14:32:06 | 1 |
| 2021-03-24 14:32:37 | 1 |
| 2021-03-24 14:33:08 | 1 |
| 2021-03-24 14:33:38 | 1 |
| 2021-03-24 14:34:09 | 1 |
| 2021-03-24 14:34:40 | 1 |
| 2021-03-24 14:35:10 | 1 |
| 2021-03-24 14:35:41 | 1 |
| 2021-03-24 14:36:12 | 1 |
| 2021-03-24 14:36:43 | 1 |
| 2021-03-24 14:37:13 | 1 |
| 2021-03-24 14:37:44 | 1 |
| 2021-03-24 14:38:15 | 1 |
| 2021-03-24 14:38:45 | 1 |
| 2021-03-24 14:39:16 | 1 |
| 2021-03-24 14:39:47 | 1 |
| 2021-03-24 14:40:17 | 1 |
| 2021-03-24 14:40:48 | 1 |
| 2021-03-24 14:41:19 | 1 |
| 2021-03-24 14:41:49 | 1 |
| 2021-03-24 14:42:20 | 1 |
| 2021-03-24 14:42:51 | 1 |
| 2021-03-24 14:43:21 | 1 |
| 2021-03-24 14:43:52 | 1 |
| 2021-03-24 14:44:23 | 1 |
| 2021-03-24 14:44:53 | 1 |
| 2021-03-24 14:45:24 | 1 |
| 2021-03-24 14:45:55 | 1 |
| 2021-03-24 14:46:25 | 1 |
| 2021-03-24 14:46:56 | 1 |
| 2021-03-24 14:47:27 | 1 |
| 2021-03-24 14:47:57 | 1 |
| 2021-03-24 14:48:28 | 1 |
| 2021-03-24 14:48:59 | 1 |
| 2021-03-24 14:49:29 | 1 |
| 2021-03-24 14:50:00 | 1 |
| 2021-03-24 14:50:31 | 1 |
| 2021-03-24 14:51:02 | 1 |
| 2021-03-24 14:51:32 | 1 |
| 2021-03-24 14:52:03 | 1 |
| 2021-03-24 14:52:34 | 1 |
| 2021-03-24 14:53:04 | 1 |
| 2021-03-24 14:53:35 | 1 |
| 2021-03-24 14:54:06 | 1 |
| 2021-03-24 14:54:36 | 1 |
| 2021-03-24 14:55:07 | 1 |
| 2021-03-24 14:55:38 | 1 |
| 2021-03-24 14:56:08 | 1 |
| 2021-03-24 14:56:39 | 1 |
| 2021-03-24 14:57:10 | 1 |
| 2021-03-24 14:57:40 | 1 |
| 2021-03-24 14:58:11 | 1 |
| 2021-03-24 14:58:42 | 1 |
| 2021-03-24 14:59:12 | 1 |
| 2021-03-24 14:59:43 | 1 |
| 2021-03-24 15:00:14 | 1 |
| 2021-03-24 15:00:44 | 1 |
| 2021-03-24 15:01:15 | 1 |
| 2021-03-24 15:01:46 | 1 |
| 2021-03-24 15:02:16 | 1 |
| 2021-03-24 15:02:47 | 1 |
| 2021-03-24 15:03:18 | 1 |
| 2021-03-24 15:03:48 | 1 |
| 2021-03-24 15:04:19 | 1 |
| 2021-03-24 15:04:50 | 1 |
| 2021-03-24 15:05:20 | 1 |
| 2021-03-24 15:05:51 | 1 |
| 2021-03-24 15:06:22 | 1 |
| 2021-03-24 15:06:52 | 1 |
| 2021-03-24 15:07:23 | 1 |
| 2021-03-24 15:07:54 | 1 |
| 2021-03-24 15:08:24 | 1 |
| 2021-03-24 15:08:55 | 1 |
| 2021-03-24 15:09:26 | 1 |
| 2021-03-24 15:09:57 | 1 |
| 2021-03-24 15:10:27 | 1 |
| 2021-03-24 15:10:58 | 1 |
| 2021-03-24 15:11:29 | 1 |
| 2021-03-24 15:11:59 | 1 |
| 2021-03-24 15:12:30 | 1 |
| 2021-03-24 15:13:01 | 1 |
| 2021-03-24 15:13:31 | 1 |
| 2021-03-24 15:14:02 | 1 |
| 2021-03-24 15:14:33 | 1 |
| 2021-03-24 15:15:03 | 1 |
| 2021-03-24 15:15:34 | 1 |
| 2021-03-24 15:16:05 | 1 |
| 2021-03-24 15:16:35 | 1 |
| 2021-03-24 15:17:06 | 1 |
| 2021-03-24 15:17:37 | 1 |
| 2021-03-24 15:18:07 | 1 |
| 2021-03-24 15:18:38 | 1 |
| 2021-03-24 15:19:09 | 1 |
| 2021-03-24 15:19:39 | 1 |
| 2021-03-24 15:20:10 | 1 |
| 2021-03-24 15:20:41 | 1 |
| 2021-03-24 15:21:11 | 1 |
| 2021-03-24 15:21:42 | 1 |
| 2021-03-24 15:22:13 | 1 |
| 2021-03-24 15:22:43 | 1 |
| 2021-03-24 15:23:14 | 1 |
| 2021-03-24 15:23:45 | 1 |
| 2021-03-24 15:24:16 | 1 |
| 2021-03-24 15:24:46 | 1 |
| 2021-03-24 15:25:17 | 1 |
| 2021-03-24 15:25:48 | 1 |
| 2021-03-24 15:26:18 | 1 |
| 2021-03-24 15:26:49 | 1 |
| 2021-03-24 15:27:20 | 1 |
| 2021-03-24 15:27:50 | 1 |
| 2021-03-24 15:28:21 | 1 |
| 2021-03-24 15:28:52 | 1 |
| 2021-03-24 15:29:22 | 1 |
| 2021-03-24 15:29:53 | 1 |
| 2021-03-24 15:30:24 | 1 |
| 2021-03-24 15:30:54 | 1 |
| 2021-03-24 15:31:25 | 1 |
| 2021-03-24 15:31:56 | 1 |
| 2021-03-24 15:32:26 | 1 |
| 2021-03-24 15:32:57 | 1 |
| 2021-03-24 15:33:28 | 1 |
| 2021-03-24 15:33:58 | 1 |
| 2021-03-24 15:34:29 | 1 |
| 2021-03-24 15:35:00 | 1 |
| 2021-03-24 15:35:30 | 1 |
| 2021-03-24 15:36:01 | 1 |
| 2021-03-24 15:36:32 | 1 |
| 2021-03-24 15:37:03 | 1 |
| 2021-03-24 15:37:33 | 1 |
| 2021-03-24 15:38:04 | 1 |
| 2021-03-24 15:38:35 | 1 |
| 2021-03-24 15:39:05 | 1 |
| 2021-03-24 15:39:36 | 1 |
| 2021-03-24 15:40:07 | 1 |
| 2021-03-24 15:40:37 | 1 |
| 2021-03-24 15:41:08 | 1 |
| 2021-03-24 15:41:39 | 1 |
| 2021-03-24 15:42:09 | 1 |
| 2021-03-24 15:42:40 | 1 |
| 2021-03-24 15:43:11 | 1 |
| 2021-03-24 15:43:41 | 1 |
| 2021-03-24 15:44:12 | 1 |
| 2021-03-24 15:44:43 | 1 |
| 2021-03-24 15:45:13 | 1 |
| 2021-03-24 15:45:44 | 1 |
| 2021-03-24 15:46:15 | 1 |
| 2021-03-24 15:46:45 | 1 |
| 2021-03-24 15:47:16 | 1 |
| 2021-03-24 15:47:47 | 1 |
| 2021-03-24 15:48:17 | 1 |
| 2021-03-24 15:48:48 | 1 |
| 2021-03-24 15:49:19 | 1 |
| 2021-03-24 15:49:50 | 1 |
| 2021-03-24 15:50:20 | 1 |
| 2021-03-24 15:50:51 | 1 |
| 2021-03-24 15:51:22 | 1 |
| 2021-03-24 15:51:52 | 1 |
| 2021-03-24 15:52:23 | 1 |
| 2021-03-24 15:52:54 | 1 |
| 2021-03-24 15:53:24 | 1 |
| 2021-03-24 15:53:55 | 1 |
| 2021-03-24 15:54:26 | 1 |
| 2021-03-24 15:54:56 | 1 |
| 2021-03-24 15:55:27 | 1 |
| 2021-03-24 15:55:58 | 1 |
| 2021-03-24 15:56:28 | 1 |
| 2021-03-24 15:56:59 | 1 |
| 2021-03-24 15:57:30 | 1 |
| 2021-03-24 15:58:00 | 1 |
| 2021-03-24 15:58:31 | 1 |
| 2021-03-24 15:59:02 | 1 |
| 2021-03-24 15:59:32 | 1 |
| 2021-03-24 16:00:03 | 1 |
| 2021-03-24 16:00:34 | 1 |
| 2021-03-24 16:01:04 | 1 |
| 2021-03-24 16:01:35 | 1 |
| 2021-03-24 16:02:06 | 1 |
| 2021-03-24 16:02:36 | 1 |
| 2021-03-24 16:03:07 | 1 |
| 2021-03-24 16:03:38 | 1 |
| 2021-03-24 16:04:09 | 1 |
| 2021-03-24 16:04:39 | 1 |
| 2021-03-24 16:05:10 | 1 |
| 2021-03-24 16:05:41 | 1 |
| 2021-03-24 16:06:11 | 1 |
| 2021-03-24 16:06:42 | 1 |
| 2021-03-24 16:07:13 | 1 |
| 2021-03-24 16:07:43 | 1 |
| 2021-03-24 16:08:14 | 1 |
| 2021-03-24 16:08:45 | 1 |
| 2021-03-24 16:09:15 | 1 |
| 2021-03-24 16:09:46 | 1 |
| 2021-03-24 16:10:17 | 1 |
| 2021-03-24 16:10:47 | 1 |
| 2021-03-24 16:11:18 | 1 |
| 2021-03-24 16:11:49 | 1 |
| 2021-03-24 16:12:19 | 1 |
| 2021-03-24 16:12:50 | 1 |
| 2021-03-24 16:13:21 | 1 |
| 2021-03-24 16:13:51 | 1 |
| 2021-03-24 16:14:22 | 1 |
| 2021-03-24 16:14:53 | 1 |
| 2021-03-24 16:15:23 | 1 |
| 2021-03-24 16:15:54 | 1 |
| 2021-03-24 16:16:25 | 1 |
| 2021-03-24 16:16:55 | 1 |
| 2021-03-24 16:17:26 | 1 |
| 2021-03-24 16:17:57 | 1 |
| 2021-03-24 16:18:27 | 1 |
| 2021-03-24 16:18:58 | 1 |
| 2021-03-24 16:19:29 | 1 |
| 2021-03-24 16:20:00 | 1 |
| 2021-03-24 16:20:30 | 1 |
| 2021-03-24 16:21:01 | 1 |
| 2021-03-24 16:21:32 | 1 |
| 2021-03-24 16:22:02 | 1 |
| 2021-03-24 16:22:33 | 1 |
| 2021-03-24 16:23:04 | 1 |
| 2021-03-24 16:23:34 | 1 |
| 2021-03-24 16:24:05 | 1 |
| 2021-03-24 16:24:36 | 1 |
| 2021-03-24 16:25:06 | 1 |
| 2021-03-24 16:25:37 | 1 |
| 2021-03-24 16:26:08 | 1 |
| 2021-03-24 16:26:38 | 1 |
| 2021-03-24 16:27:09 | 1 |
| 2021-03-24 16:27:40 | 1 |
| 2021-03-24 16:28:10 | 1 |
| 2021-03-24 16:28:41 | 1 |
| 2021-03-24 16:29:12 | 1 |
| 2021-03-24 16:29:42 | 1 |
| 2021-03-24 16:30:13 | 1 |
| 2021-03-24 16:30:44 | 1 |
| 2021-03-24 16:31:14 | 1 |
| 2021-03-24 16:31:45 | 1 |
| 2021-03-24 16:32:16 | 1 |
| 2021-03-24 16:32:47 | 1 |
| 2021-03-24 16:33:17 | 1 |
| 2021-03-24 16:33:48 | 1 |
| 2021-03-24 16:34:19 | 1 |
| 2021-03-24 16:34:49 | 1 |
| 2021-03-24 16:35:20 | 1 |
| 2021-03-24 16:35:51 | 1 |
| 2021-03-24 16:36:21 | 1 |
| 2021-03-24 16:36:52 | 1 |
| 2021-03-24 16:37:23 | 1 |
| 2021-03-24 16:37:53 | 1 |
| 2021-03-24 16:38:24 | 1 |
| 2021-03-24 16:38:55 | 1 |
| 2021-03-24 16:39:25 | 1 |
| 2021-03-24 16:39:56 | 1 |
| 2021-03-24 16:40:27 | 1 |
| 2021-03-24 16:40:57 | 1 |
| 2021-03-24 16:41:28 | 1 |
| 2021-03-24 16:41:59 | 1 |
| 2021-03-24 16:42:29 | 1 |
| 2021-03-24 16:43:00 | 1 |
| 2021-03-24 16:43:31 | 1 |
| 2021-03-24 16:44:01 | 1 |
| 2021-03-24 16:44:32 | 1 |
| 2021-03-24 16:45:03 | 1 |
| 2021-03-24 16:45:34 | 1 |
| 2021-03-24 16:46:04 | 1 |
| 2021-03-24 16:46:35 | 1 |
| 2021-03-24 16:47:06 | 1 |
| 2021-03-24 16:47:36 | 1 |
| 2021-03-24 16:48:07 | 1 |
| 2021-03-24 16:48:38 | 1 |
| 2021-03-24 16:49:08 | 1 |
| 2021-03-24 16:49:39 | 1 |
| 2021-03-24 16:50:10 | 1 |
| 2021-03-24 16:50:40 | 1 |
| 2021-03-24 16:51:11 | 1 |
| 2021-03-24 16:51:42 | 1 |
| 2021-03-24 16:52:12 | 1 |
| 2021-03-24 16:52:43 | 1 |
| 2021-03-24 16:53:14 | 1 |
| 2021-03-24 16:53:44 | 1 |
| 2021-03-24 16:54:15 | 1 |
| 2021-03-24 16:54:46 | 1 |
| 2021-03-24 16:55:16 | 1 |
| 2021-03-24 16:55:47 | 1 |
| 2021-03-24 16:56:18 | 1 |
| 2021-03-24 16:56:49 | 1 |
| 2021-03-24 16:57:19 | 1 |
| 2021-03-24 16:57:50 | 1 |
| 2021-03-24 16:58:21 | 1 |
| 2021-03-24 16:58:51 | 1 |
| 2021-03-24 16:59:22 | 1 |
| 2021-03-24 16:59:53 | 1 |
| 2021-03-24 17:00:23 | 1 |
| 2021-03-24 17:00:54 | 1 |
| 2021-03-24 17:01:25 | 1 |
| 2021-03-24 17:01:55 | 1 |
| 2021-03-24 17:02:26 | 1 |
| 2021-03-24 17:02:57 | 1 |
| 2021-03-24 17:03:27 | 1 |
| 2021-03-24 17:03:58 | 1 |
| 2021-03-24 17:04:29 | 1 |
| 2021-03-24 17:04:59 | 1 |
| 2021-03-24 17:05:30 | 1 |
| 2021-03-24 17:06:01 | 1 |
| 2021-03-24 17:06:31 | 1 |
| 2021-03-24 17:07:02 | 1 |
| 2021-03-24 17:07:33 | 1 |
| 2021-03-24 17:08:03 | 1 |
| 2021-03-24 17:08:34 | 1 |
| 2021-03-24 17:09:05 | 1 |
| 2021-03-24 17:09:35 | 1 |
| 2021-03-24 17:10:06 | 1 |
| 2021-03-24 17:10:37 | 1 |
| 2021-03-24 17:11:08 | 1 |
| 2021-03-24 17:11:38 | 1 |
| 2021-03-24 17:12:09 | 1 |
| 2021-03-24 17:12:40 | 1 |
| 2021-03-24 17:13:10 | 1 |
| 2021-03-24 17:13:41 | 1 |
| 2021-03-24 17:14:12 | 1 |
| 2021-03-24 17:14:42 | 1 |
| 2021-03-24 17:15:13 | 1 |
| 2021-03-24 17:15:44 | 1 |
| 2021-03-24 17:16:14 | 1 |
| 2021-03-24 17:16:45 | 1 |
| 2021-03-24 17:17:16 | 1 |
| 2021-03-24 17:17:46 | 1 |
| 2021-03-24 17:18:17 | 1 |
| 2021-03-24 17:18:48 | 1 |
| 2021-03-24 17:19:18 | 1 |
| 2021-03-24 17:19:49 | 1 |
| 2021-03-24 17:20:20 | 1 |
| 2021-03-24 17:20:50 | 1 |
| 2021-03-24 17:21:21 | 1 |
| 2021-03-24 17:21:52 | 1 |
| 2021-03-24 17:22:22 | 1 |
| 2021-03-24 17:22:53 | 1 |
| 2021-03-24 17:23:24 | 1 |
| 2021-03-24 17:23:54 | 1 |
| 2021-03-24 17:24:25 | 1 |
| 2021-03-24 17:24:56 | 1 |
| 2021-03-24 17:25:27 | 1 |
| 2021-03-24 17:25:57 | 1 |
| 2021-03-24 17:26:28 | 1 |
| 2021-03-24 17:26:59 | 1 |
| 2021-03-24 17:27:29 | 1 |
| 2021-03-24 17:28:00 | 1 |
| 2021-03-24 17:28:31 | 1 |
| 2021-03-24 17:29:01 | 1 |
| 2021-03-24 17:29:32 | 1 |
| 2021-03-24 17:30:03 | 1 |
| 2021-03-24 17:30:33 | 1 |
| 2021-03-24 17:31:04 | 1 |
| 2021-03-24 17:31:35 | 1 |
| 2021-03-24 17:32:05 | 1 |
| 2021-03-24 17:32:36 | 1 |
| 2021-03-24 17:33:07 | 1 |
| 2021-03-24 17:33:37 | 1 |
| 2021-03-24 17:34:08 | 1 |
| 2021-03-24 17:34:39 | 1 |
| 2021-03-24 17:35:09 | 1 |
| 2021-03-24 17:35:40 | 1 |
| 2021-03-24 17:36:11 | 1 |
| 2021-03-24 17:36:41 | 1 |
| 2021-03-24 17:37:12 | 1 |
| 2021-03-24 17:37:43 | 1 |
| 2021-03-24 17:38:14 | 1 |
| 2021-03-24 17:38:44 | 1 |
| 2021-03-24 17:39:15 | 1 |
| 2021-03-24 17:39:46 | 1 |
| 2021-03-24 17:40:16 | 1 |
| 2021-03-24 17:40:47 | 1 |
| 2021-03-24 17:41:18 | 1 |
| 2021-03-24 17:41:48 | 1 |
| 2021-03-24 17:42:19 | 1 |
| 2021-03-24 17:42:50 | 1 |
| 2021-03-24 17:43:20 | 1 |
| 2021-03-24 17:43:51 | 1 |
| 2021-03-24 17:44:22 | 1 |
| 2021-03-24 17:44:52 | 1 |
| 2021-03-24 17:45:23 | 1 |
| 2021-03-24 17:45:54 | 1 |
| 2021-03-24 17:46:24 | 1 |
| 2021-03-24 17:46:55 | 1 |
| 2021-03-24 17:47:26 | 1 |
| 2021-03-24 17:47:56 | 1 |
| 2021-03-24 17:48:27 | 1 |
| 2021-03-24 17:48:58 | 1 |
| 2021-03-24 17:49:28 | 1 |
| 2021-03-24 17:49:59 | 1 |
| 2021-03-24 17:50:30 | 1 |
| 2021-03-24 17:51:01 | 1 |
| 2021-03-24 17:51:31 | 1 |
| 2021-03-24 17:52:02 | 1 |
| 2021-03-24 17:52:33 | 1 |
| 2021-03-24 17:53:03 | 1 |
| 2021-03-24 17:53:34 | 1 |
| 2021-03-24 17:54:05 | 1 |
| 2021-03-24 17:54:35 | 1 |
| 2021-03-24 17:55:06 | 1 |
| 2021-03-24 17:55:37 | 1 |
| 2021-03-24 17:56:07 | 1 |
| 2021-03-24 17:56:38 | 1 |
| 2021-03-24 17:57:09 | 1 |
| 2021-03-24 17:57:39 | 1 |
| 2021-03-24 17:58:10 | 1 |
| 2021-03-24 17:58:41 | 1 |
| 2021-03-24 17:59:11 | 1 |
| 2021-03-24 17:59:42 | 1 |
| 2021-03-24 18:00:13 | 1 |
| 2021-03-24 18:00:43 | 1 |
| 2021-03-24 18:01:14 | 1 |
| 2021-03-24 18:01:45 | 1 |
| 2021-03-24 18:02:15 | 1 |
| 2021-03-24 18:02:46 | 1 |
| 2021-03-24 18:03:17 | 1 |
| 2021-03-24 18:03:48 | 1 |
| 2021-03-24 18:04:18 | 1 |
| 2021-03-24 18:04:49 | 1 |
| 2021-03-24 18:05:20 | 1 |
| 2021-03-24 18:05:50 | 1 |
| 2021-03-24 18:06:21 | 1 |
| 2021-03-24 18:06:52 | 1 |
| 2021-03-24 18:07:22 | 1 |
| 2021-03-24 18:07:53 | 1 |
| 2021-03-24 18:08:24 | 1 |
| 2021-03-24 18:08:54 | 1 |
| 2021-03-24 18:09:25 | 1 |
| 2021-03-24 18:09:56 | 1 |
| 2021-03-24 18:10:26 | 1 |
| 2021-03-24 18:10:57 | 1 |
| 2021-03-24 18:11:28 | 1 |
| 2021-03-24 18:11:58 | 1 |
| 2021-03-24 18:12:29 | 1 |
| 2021-03-24 18:13:00 | 1 |
| 2021-03-24 18:13:30 | 1 |
| 2021-03-24 18:14:01 | 1 |
| 2021-03-24 18:14:32 | 1 |
| 2021-03-24 18:15:02 | 1 |
| 2021-03-24 18:15:33 | 1 |
| 2021-03-24 18:16:04 | 1 |
| 2021-03-24 18:16:35 | 1 |
| 2021-03-24 18:17:05 | 1 |
| 2021-03-24 18:17:36 | 1 |
| 2021-03-24 18:18:07 | 1 |
| 2021-03-24 18:18:37 | 1 |
| 2021-03-24 18:19:08 | 1 |
| 2021-03-24 18:19:39 | 1 |
| 2021-03-24 18:20:09 | 1 |
| 2021-03-24 18:20:40 | 1 |
| 2021-03-24 18:21:11 | 1 |
| 2021-03-24 18:21:41 | 1 |
| 2021-03-24 18:22:12 | 1 |
| 2021-03-24 18:22:43 | 1 |
| 2021-03-24 18:23:13 | 1 |
| 2021-03-24 18:23:44 | 1 |
| 2021-03-24 18:24:15 | 1 |
| 2021-03-24 18:24:45 | 1 |
| 2021-03-24 18:25:16 | 1 |
| 2021-03-24 18:25:47 | 1 |
| 2021-03-24 18:26:17 | 1 |
| 2021-03-24 18:26:48 | 1 |
| 2021-03-24 18:27:19 | 1 |
| 2021-03-24 18:27:49 | 1 |
| 2021-03-24 18:28:20 | 1 |
| 2021-03-24 18:28:51 | 1 |
| 2021-03-24 18:29:21 | 1 |
| 2021-03-24 18:29:52 | 1 |
| 2021-03-24 18:30:23 | 1 |
| 2021-03-24 18:30:54 | 1 |
| 2021-03-24 18:31:24 | 1 |
| 2021-03-24 18:31:55 | 1 |
| 2021-03-24 18:32:26 | 1 |
| 2021-03-24 18:32:56 | 1 |
| 2021-03-24 18:33:27 | 1 |
| 2021-03-24 18:33:58 | 1 |
| 2021-03-24 18:34:28 | 1 |
| 2021-03-24 18:34:59 | 1 |
| 2021-03-24 18:35:30 | 1 |
| 2021-03-24 18:36:00 | 1 |
| 2021-03-24 18:36:31 | 1 |
| 2021-03-24 18:37:02 | 1 |
| 2021-03-24 18:37:32 | 1 |
| 2021-03-24 18:38:03 | 1 |